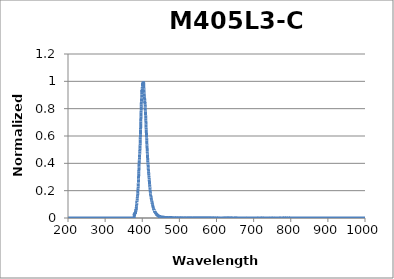
| Category | Normalized Intensity |
|---|---|
| 200.03757 | 0 |
| 200.24029 | 0 |
| 200.44301 | 0 |
| 200.64576 | 0 |
| 200.84852 | 0 |
| 201.0513 | 0 |
| 201.2541 | 0 |
| 201.45692 | 0 |
| 201.65975 | 0 |
| 201.8626 | 0 |
| 202.06546 | 0 |
| 202.26835 | 0 |
| 202.47125 | 0 |
| 202.67416 | 0 |
| 202.8771 | 0 |
| 203.08005 | 0 |
| 203.28302 | 0 |
| 203.486 | 0 |
| 203.68901 | 0 |
| 203.89203 | 0 |
| 204.09506 | 0 |
| 204.29812 | 0 |
| 204.50119 | 0 |
| 204.70428 | 0 |
| 204.90738 | 0 |
| 205.1105 | 0 |
| 205.31364 | 0 |
| 205.5168 | 0 |
| 205.71997 | 0 |
| 205.92316 | 0 |
| 206.12637 | 0 |
| 206.3296 | 0 |
| 206.53284 | 0 |
| 206.7361 | 0 |
| 206.93937 | 0 |
| 207.14266 | 0 |
| 207.34597 | 0 |
| 207.5493 | 0 |
| 207.75264 | 0 |
| 207.956 | 0 |
| 208.15938 | 0 |
| 208.36278 | 0 |
| 208.56619 | 0 |
| 208.76962 | 0 |
| 208.97306 | 0 |
| 209.17652 | 0 |
| 209.38 | 0 |
| 209.5835 | 0 |
| 209.78701 | 0 |
| 209.99054 | 0 |
| 210.19409 | 0 |
| 210.39766 | 0 |
| 210.60124 | 0 |
| 210.80484 | 0 |
| 211.00845 | 0 |
| 211.21208 | 0 |
| 211.41573 | 0 |
| 211.6194 | 0 |
| 211.82308 | 0 |
| 212.02678 | 0 |
| 212.2305 | 0 |
| 212.43423 | 0 |
| 212.63798 | 0 |
| 212.84175 | 0 |
| 213.04554 | 0 |
| 213.24934 | 0 |
| 213.45316 | 0 |
| 213.65699 | 0 |
| 213.86084 | 0 |
| 214.06471 | 0 |
| 214.2686 | 0 |
| 214.4725 | 0 |
| 214.67642 | 0 |
| 214.88036 | 0 |
| 215.08431 | 0 |
| 215.28828 | 0 |
| 215.49227 | 0 |
| 215.69628 | 0 |
| 215.9003 | 0 |
| 216.10434 | 0 |
| 216.30839 | 0 |
| 216.51246 | 0 |
| 216.71655 | 0 |
| 216.92066 | 0 |
| 217.12478 | 0 |
| 217.32892 | 0 |
| 217.53308 | 0 |
| 217.73725 | 0 |
| 217.94144 | 0 |
| 218.14565 | 0 |
| 218.34987 | 0 |
| 218.55411 | 0 |
| 218.75837 | 0 |
| 218.96264 | 0 |
| 219.16693 | 0 |
| 219.37124 | 0 |
| 219.57557 | 0 |
| 219.77991 | 0 |
| 219.98427 | 0 |
| 220.18864 | 0 |
| 220.39303 | 0 |
| 220.59744 | 0 |
| 220.80187 | 0 |
| 221.00631 | 0 |
| 221.21077 | 0 |
| 221.41525 | 0 |
| 221.61974 | 0 |
| 221.82425 | 0 |
| 222.02878 | 0 |
| 222.23332 | 0 |
| 222.43788 | 0 |
| 222.64246 | 0 |
| 222.84705 | 0 |
| 223.05166 | 0 |
| 223.25629 | 0 |
| 223.46093 | 0 |
| 223.66559 | 0 |
| 223.87027 | 0 |
| 224.07496 | 0 |
| 224.27968 | 0 |
| 224.4844 | 0 |
| 224.68915 | 0 |
| 224.89391 | 0 |
| 225.09869 | 0 |
| 225.30348 | 0 |
| 225.50829 | 0 |
| 225.71312 | 0 |
| 225.91797 | 0 |
| 226.12283 | 0 |
| 226.32771 | 0 |
| 226.5326 | 0 |
| 226.73751 | 0 |
| 226.94244 | 0 |
| 227.14739 | 0 |
| 227.35235 | 0 |
| 227.55733 | 0 |
| 227.76232 | 0 |
| 227.96734 | 0 |
| 228.17237 | 0 |
| 228.37741 | 0 |
| 228.58247 | 0 |
| 228.78755 | 0 |
| 228.99265 | 0 |
| 229.19776 | 0 |
| 229.40289 | 0 |
| 229.60803 | 0 |
| 229.8132 | 0 |
| 230.01838 | 0 |
| 230.22357 | 0 |
| 230.42878 | 0 |
| 230.63401 | 0 |
| 230.83926 | 0 |
| 231.04452 | 0 |
| 231.2498 | 0 |
| 231.4551 | 0 |
| 231.66041 | 0 |
| 231.86574 | 0 |
| 232.07108 | 0 |
| 232.27644 | 0 |
| 232.48182 | 0 |
| 232.68722 | 0 |
| 232.89263 | 0 |
| 233.09806 | 0 |
| 233.3035 | 0 |
| 233.50897 | 0 |
| 233.71444 | 0 |
| 233.91994 | 0 |
| 234.12545 | 0 |
| 234.33098 | 0 |
| 234.53653 | 0 |
| 234.74209 | 0 |
| 234.94766 | 0 |
| 235.15326 | 0 |
| 235.35887 | 0 |
| 235.5645 | 0 |
| 235.77014 | 0 |
| 235.9758 | 0 |
| 236.18148 | 0 |
| 236.38718 | 0 |
| 236.59289 | 0 |
| 236.79861 | 0 |
| 237.00436 | 0 |
| 237.21012 | 0 |
| 237.4159 | 0 |
| 237.62169 | 0 |
| 237.8275 | 0 |
| 238.03333 | 0 |
| 238.23917 | 0 |
| 238.44503 | 0 |
| 238.65091 | 0 |
| 238.8568 | 0 |
| 239.06271 | 0 |
| 239.26863 | 0 |
| 239.47458 | 0 |
| 239.68054 | 0 |
| 239.88651 | 0 |
| 240.0925 | 0 |
| 240.29851 | 0 |
| 240.50454 | 0 |
| 240.71058 | 0 |
| 240.91664 | 0 |
| 241.12271 | 0 |
| 241.3288 | 0 |
| 241.53491 | 0 |
| 241.74103 | 0 |
| 241.94717 | 0 |
| 242.15333 | 0 |
| 242.3595 | 0 |
| 242.56569 | 0 |
| 242.7719 | 0 |
| 242.97812 | 0 |
| 243.18436 | 0 |
| 243.39062 | 0 |
| 243.59689 | 0 |
| 243.80318 | 0 |
| 244.00949 | 0 |
| 244.21581 | 0 |
| 244.42215 | 0 |
| 244.6285 | 0 |
| 244.83487 | 0 |
| 245.04126 | 0 |
| 245.24766 | 0 |
| 245.45408 | 0 |
| 245.66052 | 0 |
| 245.86697 | 0 |
| 246.07344 | 0 |
| 246.27993 | 0 |
| 246.48643 | 0 |
| 246.69295 | 0 |
| 246.89949 | 0 |
| 247.10604 | 0 |
| 247.31261 | 0 |
| 247.51919 | 0 |
| 247.72579 | 0 |
| 247.93241 | 0 |
| 248.13904 | 0 |
| 248.34569 | 0 |
| 248.55236 | 0 |
| 248.75904 | 0 |
| 248.96574 | 0 |
| 249.17246 | 0 |
| 249.37919 | 0 |
| 249.58594 | 0 |
| 249.7927 | 0 |
| 249.99948 | 0 |
| 250.20628 | 0 |
| 250.4131 | 0 |
| 250.61993 | 0 |
| 250.82677 | 0 |
| 251.03364 | 0 |
| 251.24052 | 0 |
| 251.44741 | 0 |
| 251.65432 | 0 |
| 251.86125 | 0 |
| 252.0682 | 0 |
| 252.27516 | 0 |
| 252.48213 | 0 |
| 252.68913 | 0 |
| 252.89614 | 0 |
| 253.10316 | 0 |
| 253.31021 | 0 |
| 253.51727 | 0 |
| 253.72434 | 0 |
| 253.93143 | 0 |
| 254.13854 | 0 |
| 254.34567 | 0 |
| 254.55281 | 0 |
| 254.75996 | 0 |
| 254.96714 | 0 |
| 255.17433 | 0 |
| 255.38153 | 0 |
| 255.58875 | 0 |
| 255.79599 | 0 |
| 256.00325 | 0 |
| 256.21052 | 0 |
| 256.4178 | 0 |
| 256.62511 | 0 |
| 256.83243 | 0 |
| 257.03976 | 0 |
| 257.24711 | 0 |
| 257.45448 | 0 |
| 257.66187 | 0 |
| 257.86927 | 0 |
| 258.07669 | 0 |
| 258.28412 | 0 |
| 258.49157 | 0 |
| 258.69903 | 0 |
| 258.90652 | 0 |
| 259.11401 | 0 |
| 259.32153 | 0 |
| 259.52906 | 0 |
| 259.73661 | 0 |
| 259.94417 | 0 |
| 260.15175 | 0 |
| 260.35935 | 0 |
| 260.56696 | 0 |
| 260.77459 | 0 |
| 260.98223 | 0 |
| 261.18989 | 0 |
| 261.39757 | 0 |
| 261.60526 | 0 |
| 261.81297 | 0 |
| 262.02069 | 0 |
| 262.22844 | 0 |
| 262.43619 | 0 |
| 262.64397 | 0 |
| 262.85176 | 0 |
| 263.05956 | 0 |
| 263.26739 | 0 |
| 263.47522 | 0 |
| 263.68308 | 0 |
| 263.89095 | 0 |
| 264.09884 | 0 |
| 264.30674 | 0 |
| 264.51466 | 0 |
| 264.72259 | 0 |
| 264.93055 | 0 |
| 265.13851 | 0 |
| 265.3465 | 0 |
| 265.5545 | 0 |
| 265.76251 | 0 |
| 265.97054 | 0 |
| 266.17859 | 0 |
| 266.38666 | 0 |
| 266.59474 | 0 |
| 266.80283 | 0 |
| 267.01095 | 0 |
| 267.21908 | 0 |
| 267.42722 | 0 |
| 267.63538 | 0 |
| 267.84356 | 0 |
| 268.05175 | 0 |
| 268.25996 | 0 |
| 268.46819 | 0 |
| 268.67643 | 0 |
| 268.88469 | 0 |
| 269.09296 | 0 |
| 269.30125 | 0 |
| 269.50956 | 0 |
| 269.71788 | 0 |
| 269.92622 | 0 |
| 270.13457 | 0 |
| 270.34294 | 0 |
| 270.55133 | 0 |
| 270.75973 | 0 |
| 270.96815 | 0 |
| 271.17658 | 0 |
| 271.38503 | 0 |
| 271.5935 | 0 |
| 271.80198 | 0 |
| 272.01048 | 0 |
| 272.21899 | 0 |
| 272.42753 | 0 |
| 272.63607 | 0 |
| 272.84463 | 0 |
| 273.05321 | 0 |
| 273.26181 | 0 |
| 273.47042 | 0 |
| 273.67905 | 0 |
| 273.88769 | 0 |
| 274.09635 | 0 |
| 274.30502 | 0 |
| 274.51371 | 0 |
| 274.72242 | 0 |
| 274.93114 | 0 |
| 275.13988 | 0 |
| 275.34864 | 0 |
| 275.55741 | 0 |
| 275.76619 | 0 |
| 275.975 | 0 |
| 276.18381 | 0 |
| 276.39265 | 0 |
| 276.6015 | 0 |
| 276.81037 | 0 |
| 277.01925 | 0 |
| 277.22815 | 0 |
| 277.43706 | 0 |
| 277.64599 | 0 |
| 277.85494 | 0 |
| 278.0639 | 0 |
| 278.27288 | 0 |
| 278.48187 | 0 |
| 278.69088 | 0 |
| 278.89991 | 0 |
| 279.10895 | 0 |
| 279.31801 | 0 |
| 279.52708 | 0 |
| 279.73617 | 0 |
| 279.94528 | 0 |
| 280.1544 | 0 |
| 280.36354 | 0 |
| 280.57269 | 0 |
| 280.78186 | 0 |
| 280.99104 | 0 |
| 281.20025 | 0 |
| 281.40946 | 0 |
| 281.6187 | 0 |
| 281.82794 | 0 |
| 282.03721 | 0 |
| 282.24649 | 0 |
| 282.45579 | 0 |
| 282.6651 | 0 |
| 282.87443 | 0 |
| 283.08377 | 0 |
| 283.29313 | 0 |
| 283.50251 | 0 |
| 283.7119 | 0 |
| 283.92131 | 0 |
| 284.13073 | 0 |
| 284.34017 | 0 |
| 284.54962 | 0 |
| 284.75909 | 0 |
| 284.96858 | 0 |
| 285.17808 | 0 |
| 285.3876 | 0 |
| 285.59714 | 0 |
| 285.80669 | 0 |
| 286.01625 | 0 |
| 286.22583 | 0 |
| 286.43543 | 0 |
| 286.64505 | 0 |
| 286.85467 | 0 |
| 287.06432 | 0 |
| 287.27398 | 0 |
| 287.48366 | 0 |
| 287.69335 | 0 |
| 287.90306 | 0 |
| 288.11278 | 0 |
| 288.32252 | 0 |
| 288.53228 | 0 |
| 288.74205 | 0 |
| 288.95184 | 0 |
| 289.16164 | 0 |
| 289.37146 | 0 |
| 289.58129 | 0 |
| 289.79114 | 0 |
| 290.00101 | 0 |
| 290.21089 | 0 |
| 290.42079 | 0 |
| 290.6307 | 0 |
| 290.84063 | 0 |
| 291.05058 | 0 |
| 291.26054 | 0 |
| 291.47051 | 0 |
| 291.68051 | 0 |
| 291.89051 | 0 |
| 292.10054 | 0 |
| 292.31058 | 0 |
| 292.52063 | 0 |
| 292.7307 | 0 |
| 292.94079 | 0 |
| 293.15089 | 0 |
| 293.36101 | 0 |
| 293.57114 | 0 |
| 293.78129 | 0 |
| 293.99146 | 0 |
| 294.20164 | 0 |
| 294.41183 | 0 |
| 294.62205 | 0 |
| 294.83228 | 0 |
| 295.04252 | 0 |
| 295.25278 | 0 |
| 295.46305 | 0 |
| 295.67334 | 0 |
| 295.88365 | 0 |
| 296.09397 | 0 |
| 296.30431 | 0 |
| 296.51466 | 0 |
| 296.72503 | 0 |
| 296.93542 | 0 |
| 297.14582 | 0 |
| 297.35623 | 0 |
| 297.56667 | 0 |
| 297.77711 | 0 |
| 297.98758 | 0 |
| 298.19805 | 0 |
| 298.40855 | 0 |
| 298.61906 | 0 |
| 298.82958 | 0 |
| 299.04013 | 0 |
| 299.25068 | 0 |
| 299.46126 | 0 |
| 299.67184 | 0 |
| 299.88245 | 0 |
| 300.09307 | 0 |
| 300.3037 | 0 |
| 300.51435 | 0 |
| 300.72502 | 0 |
| 300.9357 | 0 |
| 301.1464 | 0 |
| 301.35711 | 0 |
| 301.56784 | 0 |
| 301.77858 | 0 |
| 301.98934 | 0 |
| 302.20012 | 0 |
| 302.41091 | 0 |
| 302.62172 | 0 |
| 302.83254 | 0 |
| 303.04338 | 0 |
| 303.25423 | 0 |
| 303.4651 | 0 |
| 303.67598 | 0 |
| 303.88688 | 0 |
| 304.0978 | 0 |
| 304.30873 | 0 |
| 304.51968 | 0 |
| 304.73064 | 0 |
| 304.94162 | 0 |
| 305.15261 | 0 |
| 305.36362 | 0 |
| 305.57464 | 0 |
| 305.78568 | 0 |
| 305.99674 | 0 |
| 306.20781 | 0 |
| 306.4189 | 0 |
| 306.63 | 0 |
| 306.84111 | 0 |
| 307.05225 | 0 |
| 307.2634 | 0 |
| 307.47456 | 0 |
| 307.68574 | 0 |
| 307.89694 | 0 |
| 308.10815 | 0 |
| 308.31937 | 0 |
| 308.53061 | 0 |
| 308.74187 | 0 |
| 308.95314 | 0 |
| 309.16443 | 0 |
| 309.37573 | 0 |
| 309.58705 | 0 |
| 309.79839 | 0 |
| 310.00974 | 0 |
| 310.2211 | 0 |
| 310.43248 | 0 |
| 310.64388 | 0 |
| 310.85529 | 0 |
| 311.06672 | 0 |
| 311.27816 | 0 |
| 311.48962 | 0 |
| 311.70109 | 0 |
| 311.91258 | 0 |
| 312.12409 | 0 |
| 312.33561 | 0 |
| 312.54714 | 0 |
| 312.75869 | 0 |
| 312.97026 | 0 |
| 313.18184 | 0 |
| 313.39344 | 0 |
| 313.60505 | 0 |
| 313.81668 | 0 |
| 314.02832 | 0 |
| 314.23998 | 0 |
| 314.45166 | 0 |
| 314.66335 | 0 |
| 314.87505 | 0 |
| 315.08677 | 0 |
| 315.29851 | 0 |
| 315.51026 | 0 |
| 315.72202 | 0 |
| 315.93381 | 0 |
| 316.1456 | 0 |
| 316.35742 | 0 |
| 316.56925 | 0 |
| 316.78109 | 0 |
| 316.99295 | 0 |
| 317.20482 | 0 |
| 317.41671 | 0 |
| 317.62862 | 0 |
| 317.84054 | 0 |
| 318.05247 | 0 |
| 318.26442 | 0 |
| 318.47639 | 0 |
| 318.68837 | 0 |
| 318.90037 | 0 |
| 319.11238 | 0 |
| 319.32441 | 0 |
| 319.53645 | 0 |
| 319.74851 | 0 |
| 319.96058 | 0 |
| 320.17267 | 0 |
| 320.38478 | 0 |
| 320.5969 | 0 |
| 320.80903 | 0 |
| 321.02118 | 0 |
| 321.23335 | 0 |
| 321.44553 | 0 |
| 321.65772 | 0 |
| 321.86994 | 0 |
| 322.08216 | 0 |
| 322.2944 | 0 |
| 322.50666 | 0 |
| 322.71893 | 0 |
| 322.93122 | 0 |
| 323.14353 | 0 |
| 323.35584 | 0 |
| 323.56818 | 0 |
| 323.78053 | 0 |
| 323.99289 | 0 |
| 324.20527 | 0 |
| 324.41767 | 0 |
| 324.63008 | 0 |
| 324.8425 | 0 |
| 325.05494 | 0 |
| 325.2674 | 0 |
| 325.47987 | 0 |
| 325.69235 | 0 |
| 325.90486 | 0 |
| 326.11737 | 0 |
| 326.32991 | 0 |
| 326.54245 | 0 |
| 326.75502 | 0 |
| 326.96759 | 0 |
| 327.18019 | 0 |
| 327.39279 | 0 |
| 327.60542 | 0 |
| 327.81806 | 0 |
| 328.03071 | 0 |
| 328.24338 | 0 |
| 328.45606 | 0 |
| 328.66876 | 0 |
| 328.88148 | 0 |
| 329.09421 | 0 |
| 329.30695 | 0 |
| 329.51971 | 0 |
| 329.73249 | 0 |
| 329.94528 | 0 |
| 330.15808 | 0 |
| 330.3709 | 0 |
| 330.58374 | 0 |
| 330.79659 | 0 |
| 331.00946 | 0 |
| 331.22234 | 0 |
| 331.43524 | 0 |
| 331.64815 | 0 |
| 331.86107 | 0 |
| 332.07402 | 0 |
| 332.28697 | 0 |
| 332.49995 | 0 |
| 332.71293 | 0 |
| 332.92594 | 0 |
| 333.13895 | 0 |
| 333.35199 | 0 |
| 333.56504 | 0 |
| 333.7781 | 0 |
| 333.99118 | 0 |
| 334.20427 | 0 |
| 334.41738 | 0 |
| 334.6305 | 0 |
| 334.84364 | 0 |
| 335.0568 | 0 |
| 335.26996 | 0 |
| 335.48315 | 0 |
| 335.69635 | 0 |
| 335.90956 | 0 |
| 336.12279 | 0 |
| 336.33604 | 0 |
| 336.5493 | 0 |
| 336.76257 | 0 |
| 336.97586 | 0 |
| 337.18917 | 0 |
| 337.40248 | 0 |
| 337.61582 | 0 |
| 337.82917 | 0 |
| 338.04253 | 0 |
| 338.25592 | 0 |
| 338.46931 | 0 |
| 338.68272 | 0 |
| 338.89615 | 0 |
| 339.10959 | 0 |
| 339.32304 | 0 |
| 339.53651 | 0 |
| 339.75 | 0 |
| 339.9635 | 0 |
| 340.17701 | 0 |
| 340.39054 | 0 |
| 340.60409 | 0 |
| 340.81765 | 0 |
| 341.03123 | 0 |
| 341.24482 | 0 |
| 341.45842 | 0 |
| 341.67204 | 0 |
| 341.88568 | 0 |
| 342.09933 | 0 |
| 342.31299 | 0 |
| 342.52667 | 0 |
| 342.74037 | 0 |
| 342.95408 | 0 |
| 343.16781 | 0 |
| 343.38155 | 0 |
| 343.5953 | 0 |
| 343.80907 | 0 |
| 344.02286 | 0 |
| 344.23666 | 0 |
| 344.45047 | 0 |
| 344.6643 | 0 |
| 344.87815 | 0 |
| 345.09201 | 0 |
| 345.30589 | 0 |
| 345.51978 | 0 |
| 345.73368 | 0 |
| 345.9476 | 0 |
| 346.16154 | 0 |
| 346.37549 | 0 |
| 346.58945 | 0 |
| 346.80343 | 0 |
| 347.01743 | 0 |
| 347.23144 | 0 |
| 347.44546 | 0 |
| 347.6595 | 0 |
| 347.87355 | 0 |
| 348.08762 | 0 |
| 348.30171 | 0 |
| 348.51581 | 0 |
| 348.72992 | 0 |
| 348.94405 | 0 |
| 349.15819 | 0 |
| 349.37235 | 0 |
| 349.58653 | 0 |
| 349.80072 | 0 |
| 350.01492 | 0 |
| 350.22914 | 0 |
| 350.44337 | 0 |
| 350.65762 | 0 |
| 350.87188 | 0 |
| 351.08616 | 0 |
| 351.30045 | 0 |
| 351.51476 | 0 |
| 351.72908 | 0 |
| 351.94342 | 0 |
| 352.15777 | 0 |
| 352.37214 | 0 |
| 352.58652 | 0 |
| 352.80092 | 0 |
| 353.01533 | 0 |
| 353.22976 | 0 |
| 353.4442 | 0 |
| 353.65865 | 0 |
| 353.87312 | 0 |
| 354.08761 | 0 |
| 354.30211 | 0 |
| 354.51663 | 0 |
| 354.73116 | 0 |
| 354.9457 | 0 |
| 355.16026 | 0 |
| 355.37484 | 0 |
| 355.58943 | 0 |
| 355.80403 | 0 |
| 356.01865 | 0 |
| 356.23328 | 0 |
| 356.44793 | 0 |
| 356.6626 | 0 |
| 356.87727 | 0 |
| 357.09197 | 0 |
| 357.30667 | 0 |
| 357.5214 | 0 |
| 357.73613 | 0 |
| 357.95089 | 0 |
| 358.16565 | 0 |
| 358.38043 | 0 |
| 358.59523 | 0 |
| 358.81004 | 0 |
| 359.02487 | 0 |
| 359.23971 | 0 |
| 359.45456 | 0 |
| 359.66943 | 0 |
| 359.88432 | 0 |
| 360.09922 | 0 |
| 360.31413 | 0 |
| 360.52906 | 0 |
| 360.74401 | 0 |
| 360.95897 | 0 |
| 361.17394 | 0 |
| 361.38893 | 0 |
| 361.60393 | 0 |
| 361.81895 | 0 |
| 362.03398 | 0 |
| 362.24903 | 0 |
| 362.46409 | 0 |
| 362.67916 | 0 |
| 362.89426 | 0 |
| 363.10936 | 0 |
| 363.32448 | 0 |
| 363.53962 | 0 |
| 363.75477 | 0 |
| 363.96993 | 0 |
| 364.18511 | 0 |
| 364.4003 | 0 |
| 364.61551 | 0 |
| 364.83074 | 0 |
| 365.04597 | 0 |
| 365.26123 | 0 |
| 365.47649 | 0 |
| 365.69177 | 0 |
| 365.90707 | 0 |
| 366.12238 | 0 |
| 366.33771 | 0 |
| 366.55305 | 0 |
| 366.7684 | 0 |
| 366.98377 | 0 |
| 367.19916 | 0 |
| 367.41456 | 0 |
| 367.62997 | 0 |
| 367.8454 | 0 |
| 368.06084 | 0 |
| 368.2763 | 0 |
| 368.49177 | 0 |
| 368.70726 | 0 |
| 368.92276 | 0 |
| 369.13827 | 0 |
| 369.35381 | 0 |
| 369.56935 | 0 |
| 369.78491 | 0 |
| 370.00048 | 0 |
| 370.21607 | 0 |
| 370.43168 | 0 |
| 370.6473 | 0 |
| 370.86293 | 0 |
| 371.07858 | 0 |
| 371.29424 | 0 |
| 371.50991 | 0 |
| 371.7256 | 0 |
| 371.94131 | 0 |
| 372.15703 | 0 |
| 372.37276 | 0 |
| 372.58851 | 0 |
| 372.80428 | 0 |
| 373.02006 | 0 |
| 373.23585 | 0 |
| 373.45166 | 0 |
| 373.66748 | 0 |
| 373.88332 | 0 |
| 374.09917 | 0 |
| 374.31503 | 0 |
| 374.53091 | 0 |
| 374.74681 | 0 |
| 374.96272 | 0 |
| 375.17864 | 0 |
| 375.39458 | 0 |
| 375.61053 | 0 |
| 375.8265 | 0 |
| 376.04248 | 0 |
| 376.25848 | 0 |
| 376.47449 | 0 |
| 376.69051 | 0 |
| 376.90655 | 0 |
| 377.12261 | 0 |
| 377.33868 | 0 |
| 377.55476 | 0 |
| 377.77086 | 0 |
| 377.98697 | 0 |
| 378.2031 | 0 |
| 378.41924 | 0.014 |
| 378.63539 | 0.031 |
| 378.85156 | 0.019 |
| 379.06775 | 0.03 |
| 379.28395 | 0.017 |
| 379.50016 | 0.031 |
| 379.71639 | 0.029 |
| 379.93263 | 0.034 |
| 380.14889 | 0.03 |
| 380.36516 | 0.037 |
| 380.58144 | 0.028 |
| 380.79774 | 0.039 |
| 381.01406 | 0.033 |
| 381.23039 | 0.043 |
| 381.44673 | 0.035 |
| 381.66309 | 0.047 |
| 381.87946 | 0.038 |
| 382.09585 | 0.049 |
| 382.31225 | 0.044 |
| 382.52867 | 0.056 |
| 382.7451 | 0.054 |
| 382.96154 | 0.064 |
| 383.178 | 0.058 |
| 383.39447 | 0.066 |
| 383.61096 | 0.067 |
| 383.82746 | 0.074 |
| 384.04398 | 0.072 |
| 384.26051 | 0.083 |
| 384.47705 | 0.082 |
| 384.69361 | 0.094 |
| 384.91019 | 0.094 |
| 385.12678 | 0.105 |
| 385.34338 | 0.109 |
| 385.56 | 0.116 |
| 385.77663 | 0.116 |
| 385.99327 | 0.127 |
| 386.20993 | 0.129 |
| 386.42661 | 0.14 |
| 386.6433 | 0.143 |
| 386.86 | 0.152 |
| 387.07672 | 0.155 |
| 387.29345 | 0.165 |
| 387.5102 | 0.163 |
| 387.72696 | 0.179 |
| 387.94373 | 0.184 |
| 388.16052 | 0.199 |
| 388.37733 | 0.199 |
| 388.59414 | 0.212 |
| 388.81098 | 0.213 |
| 389.02782 | 0.231 |
| 389.24468 | 0.235 |
| 389.46156 | 0.253 |
| 389.67845 | 0.259 |
| 389.89535 | 0.281 |
| 390.11227 | 0.289 |
| 390.3292 | 0.314 |
| 390.54615 | 0.324 |
| 390.76311 | 0.342 |
| 390.98009 | 0.354 |
| 391.19708 | 0.371 |
| 391.41408 | 0.378 |
| 391.6311 | 0.401 |
| 391.84813 | 0.402 |
| 392.06518 | 0.423 |
| 392.28224 | 0.427 |
| 392.49931 | 0.445 |
| 392.7164 | 0.447 |
| 392.93351 | 0.465 |
| 393.15063 | 0.471 |
| 393.36776 | 0.486 |
| 393.58491 | 0.495 |
| 393.80207 | 0.501 |
| 394.01924 | 0.511 |
| 394.23643 | 0.531 |
| 394.45363 | 0.547 |
| 394.67085 | 0.573 |
| 394.88808 | 0.587 |
| 395.10533 | 0.613 |
| 395.32259 | 0.622 |
| 395.53987 | 0.648 |
| 395.75716 | 0.672 |
| 395.97446 | 0.694 |
| 396.19178 | 0.706 |
| 396.40911 | 0.745 |
| 396.62645 | 0.754 |
| 396.84381 | 0.773 |
| 397.06119 | 0.786 |
| 397.27858 | 0.813 |
| 397.49598 | 0.832 |
| 397.7134 | 0.85 |
| 397.93083 | 0.855 |
| 398.14827 | 0.876 |
| 398.36573 | 0.881 |
| 398.58321 | 0.902 |
| 398.8007 | 0.905 |
| 399.0182 | 0.92 |
| 399.23571 | 0.927 |
| 399.45324 | 0.938 |
| 399.67079 | 0.919 |
| 399.88835 | 0.937 |
| 400.10592 | 0.946 |
| 400.32351 | 0.959 |
| 400.54111 | 0.962 |
| 400.75872 | 0.968 |
| 400.97635 | 0.981 |
| 401.194 | 0.991 |
| 401.41166 | 0.984 |
| 401.62933 | 0.986 |
| 401.84701 | 0.979 |
| 402.06471 | 0.978 |
| 402.28243 | 0.97 |
| 402.50016 | 0.99 |
| 402.7179 | 0.997 |
| 402.93566 | 1 |
| 403.15343 | 0.996 |
| 403.37121 | 0.988 |
| 403.58901 | 0.99 |
| 403.80682 | 0.992 |
| 404.02465 | 0.982 |
| 404.24249 | 0.965 |
| 404.46035 | 0.947 |
| 404.67822 | 0.94 |
| 404.8961 | 0.922 |
| 405.114 | 0.922 |
| 405.33191 | 0.92 |
| 405.54984 | 0.911 |
| 405.76778 | 0.89 |
| 405.98573 | 0.879 |
| 406.2037 | 0.87 |
| 406.42168 | 0.874 |
| 406.63968 | 0.861 |
| 406.85769 | 0.85 |
| 407.07571 | 0.842 |
| 407.29375 | 0.847 |
| 407.51181 | 0.832 |
| 407.72987 | 0.833 |
| 407.94795 | 0.815 |
| 408.16605 | 0.809 |
| 408.38416 | 0.789 |
| 408.60228 | 0.778 |
| 408.82042 | 0.767 |
| 409.03857 | 0.754 |
| 409.25673 | 0.752 |
| 409.47491 | 0.727 |
| 409.69311 | 0.712 |
| 409.91131 | 0.694 |
| 410.12953 | 0.686 |
| 410.34777 | 0.663 |
| 410.56602 | 0.648 |
| 410.78428 | 0.637 |
| 411.00256 | 0.629 |
| 411.22085 | 0.618 |
| 411.43915 | 0.604 |
| 411.65747 | 0.589 |
| 411.87581 | 0.583 |
| 412.09415 | 0.568 |
| 412.31251 | 0.556 |
| 412.53089 | 0.537 |
| 412.74928 | 0.532 |
| 412.96768 | 0.523 |
| 413.1861 | 0.507 |
| 413.40453 | 0.489 |
| 413.62298 | 0.486 |
| 413.84143 | 0.472 |
| 414.05991 | 0.465 |
| 414.27839 | 0.446 |
| 414.49689 | 0.439 |
| 414.71541 | 0.429 |
| 414.93394 | 0.422 |
| 415.15248 | 0.406 |
| 415.37104 | 0.403 |
| 415.58961 | 0.391 |
| 415.80819 | 0.388 |
| 416.02679 | 0.37 |
| 416.2454 | 0.364 |
| 416.46403 | 0.355 |
| 416.68267 | 0.351 |
| 416.90132 | 0.338 |
| 417.11999 | 0.336 |
| 417.33867 | 0.323 |
| 417.55737 | 0.324 |
| 417.77608 | 0.312 |
| 417.9948 | 0.309 |
| 418.21354 | 0.297 |
| 418.43229 | 0.297 |
| 418.65106 | 0.282 |
| 418.86984 | 0.278 |
| 419.08863 | 0.27 |
| 419.30744 | 0.265 |
| 419.52626 | 0.256 |
| 419.74509 | 0.251 |
| 419.96394 | 0.243 |
| 420.18281 | 0.241 |
| 420.40168 | 0.228 |
| 420.62057 | 0.224 |
| 420.83948 | 0.213 |
| 421.0584 | 0.21 |
| 421.27733 | 0.202 |
| 421.49627 | 0.196 |
| 421.71523 | 0.187 |
| 421.93421 | 0.188 |
| 422.15319 | 0.178 |
| 422.37219 | 0.178 |
| 422.59121 | 0.169 |
| 422.81024 | 0.168 |
| 423.02928 | 0.16 |
| 423.24834 | 0.16 |
| 423.46741 | 0.152 |
| 423.68649 | 0.15 |
| 423.90559 | 0.146 |
| 424.1247 | 0.146 |
| 424.34383 | 0.139 |
| 424.56297 | 0.14 |
| 424.78212 | 0.133 |
| 425.00129 | 0.135 |
| 425.22047 | 0.129 |
| 425.43966 | 0.13 |
| 425.65887 | 0.122 |
| 425.8781 | 0.123 |
| 426.09733 | 0.115 |
| 426.31658 | 0.114 |
| 426.53585 | 0.108 |
| 426.75512 | 0.111 |
| 426.97441 | 0.105 |
| 427.19372 | 0.108 |
| 427.41304 | 0.098 |
| 427.63237 | 0.1 |
| 427.85172 | 0.096 |
| 428.07108 | 0.094 |
| 428.29045 | 0.089 |
| 428.50984 | 0.088 |
| 428.72924 | 0.083 |
| 428.94865 | 0.084 |
| 429.16808 | 0.079 |
| 429.38753 | 0.078 |
| 429.60698 | 0.077 |
| 429.82645 | 0.076 |
| 430.04594 | 0.069 |
| 430.26543 | 0.071 |
| 430.48495 | 0.067 |
| 430.70447 | 0.067 |
| 430.92401 | 0.062 |
| 431.14356 | 0.065 |
| 431.36313 | 0.059 |
| 431.58271 | 0.062 |
| 431.8023 | 0.06 |
| 432.02191 | 0.06 |
| 432.24153 | 0.057 |
| 432.46116 | 0.056 |
| 432.68081 | 0.052 |
| 432.90048 | 0.052 |
| 433.12015 | 0.049 |
| 433.33984 | 0.051 |
| 433.55954 | 0.046 |
| 433.77926 | 0.048 |
| 433.99899 | 0.045 |
| 434.21874 | 0.046 |
| 434.43849 | 0.044 |
| 434.65827 | 0.045 |
| 434.87805 | 0.039 |
| 435.09785 | 0.041 |
| 435.31766 | 0.038 |
| 435.53749 | 0.039 |
| 435.75733 | 0.036 |
| 435.97718 | 0.038 |
| 436.19705 | 0.033 |
| 436.41693 | 0.036 |
| 436.63682 | 0.032 |
| 436.85673 | 0.036 |
| 437.07665 | 0.032 |
| 437.29659 | 0.031 |
| 437.51654 | 0.03 |
| 437.7365 | 0.031 |
| 437.95648 | 0.028 |
| 438.17647 | 0.029 |
| 438.39647 | 0.026 |
| 438.61649 | 0.029 |
| 438.83652 | 0.025 |
| 439.05656 | 0.028 |
| 439.27662 | 0.024 |
| 439.49669 | 0.027 |
| 439.71678 | 0.022 |
| 439.93688 | 0.025 |
| 440.15699 | 0.022 |
| 440.37712 | 0.022 |
| 440.59725 | 0.02 |
| 440.81741 | 0.022 |
| 441.03757 | 0.019 |
| 441.25775 | 0.02 |
| 441.47795 | 0.018 |
| 441.69816 | 0.02 |
| 441.91838 | 0.017 |
| 442.13861 | 0.019 |
| 442.35886 | 0.017 |
| 442.57912 | 0.018 |
| 442.7994 | 0.015 |
| 443.01969 | 0.017 |
| 443.23999 | 0.014 |
| 443.4603 | 0.016 |
| 443.68063 | 0.013 |
| 443.90098 | 0.015 |
| 444.12133 | 0.013 |
| 444.3417 | 0.014 |
| 444.56209 | 0.012 |
| 444.78248 | 0.014 |
| 445.00289 | 0.01 |
| 445.22332 | 0.014 |
| 445.44376 | 0.01 |
| 445.66421 | 0.014 |
| 445.88467 | 0.01 |
| 446.10515 | 0.013 |
| 446.32564 | 0.011 |
| 446.54615 | 0.012 |
| 446.76666 | 0.011 |
| 446.9872 | 0.012 |
| 447.20774 | 0.009 |
| 447.4283 | 0.011 |
| 447.64887 | 0.01 |
| 447.86946 | 0.011 |
| 448.09006 | 0.008 |
| 448.31067 | 0.01 |
| 448.5313 | 0.008 |
| 448.75194 | 0.009 |
| 448.97259 | 0.008 |
| 449.19326 | 0.01 |
| 449.41394 | 0.007 |
| 449.63463 | 0.009 |
| 449.85534 | 0.007 |
| 450.07606 | 0.008 |
| 450.2968 | 0.006 |
| 450.51754 | 0.008 |
| 450.73831 | 0.006 |
| 450.95908 | 0.008 |
| 451.17987 | 0.006 |
| 451.40067 | 0.008 |
| 451.62148 | 0.006 |
| 451.84231 | 0.007 |
| 452.06315 | 0.006 |
| 452.28401 | 0.008 |
| 452.50488 | 0.005 |
| 452.72576 | 0.008 |
| 452.94666 | 0.005 |
| 453.16756 | 0.007 |
| 453.38849 | 0.004 |
| 453.60942 | 0.007 |
| 453.83037 | 0.004 |
| 454.05133 | 0.006 |
| 454.27231 | 0.004 |
| 454.4933 | 0.007 |
| 454.7143 | 0.004 |
| 454.93532 | 0.006 |
| 455.15635 | 0.005 |
| 455.37739 | 0.006 |
| 455.59845 | 0.004 |
| 455.81951 | 0.006 |
| 456.0406 | 0.004 |
| 456.26169 | 0.005 |
| 456.4828 | 0.003 |
| 456.70393 | 0.006 |
| 456.92506 | 0.003 |
| 457.14621 | 0.005 |
| 457.36738 | 0.002 |
| 457.58855 | 0.006 |
| 457.80974 | 0.003 |
| 458.03094 | 0.005 |
| 458.25216 | 0.003 |
| 458.47339 | 0.004 |
| 458.69463 | 0.003 |
| 458.91589 | 0.004 |
| 459.13716 | 0.004 |
| 459.35844 | 0.004 |
| 459.57974 | 0.002 |
| 459.80105 | 0.005 |
| 460.02237 | 0.003 |
| 460.24371 | 0.004 |
| 460.46506 | 0.002 |
| 460.68642 | 0.004 |
| 460.9078 | 0.003 |
| 461.12919 | 0.004 |
| 461.35059 | 0.003 |
| 461.572 | 0.004 |
| 461.79343 | 0.002 |
| 462.01488 | 0.004 |
| 462.23633 | 0.002 |
| 462.4578 | 0.004 |
| 462.67928 | 0.002 |
| 462.90078 | 0.003 |
| 463.12229 | 0.002 |
| 463.34381 | 0.004 |
| 463.56535 | 0.002 |
| 463.78689 | 0.004 |
| 464.00846 | 0.002 |
| 464.23003 | 0.003 |
| 464.45162 | 0.002 |
| 464.67322 | 0.004 |
| 464.89484 | 0.002 |
| 465.11647 | 0.004 |
| 465.33811 | 0.003 |
| 465.55976 | 0.003 |
| 465.78143 | 0.004 |
| 466.00311 | 0.002 |
| 466.2248 | 0.003 |
| 466.44651 | 0.002 |
| 466.66823 | 0.004 |
| 466.88997 | 0.002 |
| 467.11171 | 0.003 |
| 467.33348 | 0.002 |
| 467.55525 | 0.003 |
| 467.77704 | 0.002 |
| 467.99884 | 0.004 |
| 468.22065 | 0.002 |
| 468.44248 | 0.003 |
| 468.66432 | 0.001 |
| 468.88617 | 0.003 |
| 469.10803 | 0.001 |
| 469.32991 | 0.003 |
| 469.55181 | 0.001 |
| 469.77371 | 0.003 |
| 469.99563 | 0.001 |
| 470.21756 | 0.004 |
| 470.43951 | 0.001 |
| 470.66146 | 0.003 |
| 470.88344 | 0.001 |
| 471.10542 | 0.003 |
| 471.32742 | 0.001 |
| 471.54943 | 0.003 |
| 471.77145 | 0.002 |
| 471.99349 | 0.003 |
| 472.21554 | 0.001 |
| 472.4376 | 0.003 |
| 472.65968 | 0.001 |
| 472.88177 | 0.003 |
| 473.10387 | 0.001 |
| 473.32599 | 0.003 |
| 473.54812 | 0.001 |
| 473.77026 | 0.003 |
| 473.99242 | 0.002 |
| 474.21458 | 0.003 |
| 474.43677 | 0.001 |
| 474.65896 | 0.003 |
| 474.88117 | 0.002 |
| 475.10339 | 0.003 |
| 475.32562 | 0.001 |
| 475.54787 | 0.003 |
| 475.77013 | 0.002 |
| 475.9924 | 0.003 |
| 476.21469 | 0.001 |
| 476.43699 | 0.002 |
| 476.6593 | 0.001 |
| 476.88163 | 0.003 |
| 477.10397 | 0.001 |
| 477.32632 | 0.003 |
| 477.54868 | 0.002 |
| 477.77106 | 0.002 |
| 477.99345 | 0.001 |
| 478.21585 | 0.003 |
| 478.43827 | 0.002 |
| 478.6607 | 0.004 |
| 478.88314 | 0.001 |
| 479.1056 | 0.003 |
| 479.32807 | 0.002 |
| 479.55055 | 0.002 |
| 479.77305 | 0.001 |
| 479.99555 | 0.002 |
| 480.21808 | 0.001 |
| 480.44061 | 0.003 |
| 480.66316 | 0.001 |
| 480.88572 | 0.002 |
| 481.10829 | 0.002 |
| 481.33088 | 0.003 |
| 481.55348 | 0.001 |
| 481.77609 | 0.003 |
| 481.99871 | 0.001 |
| 482.22135 | 0.002 |
| 482.444 | 0.001 |
| 482.66667 | 0.002 |
| 482.88935 | 0.001 |
| 483.11204 | 0.002 |
| 483.33474 | 0.001 |
| 483.55746 | 0.002 |
| 483.78019 | 0.001 |
| 484.00293 | 0.002 |
| 484.22568 | 0.002 |
| 484.44845 | 0.002 |
| 484.67123 | 0 |
| 484.89403 | 0.002 |
| 485.11683 | 0.001 |
| 485.33965 | 0.003 |
| 485.56249 | 0.001 |
| 485.78533 | 0.002 |
| 486.00819 | 0.001 |
| 486.23106 | 0.003 |
| 486.45395 | 0 |
| 486.67685 | 0.002 |
| 486.89976 | 0.001 |
| 487.12268 | 0.003 |
| 487.34562 | 0.001 |
| 487.56857 | 0.003 |
| 487.79153 | 0.001 |
| 488.0145 | 0.002 |
| 488.23749 | 0.001 |
| 488.46049 | 0.002 |
| 488.68351 | 0.001 |
| 488.90653 | 0.002 |
| 489.12957 | 0.001 |
| 489.35263 | 0.003 |
| 489.57569 | 0.001 |
| 489.79877 | 0.002 |
| 490.02186 | 0.001 |
| 490.24497 | 0.002 |
| 490.46808 | 0.001 |
| 490.69121 | 0.002 |
| 490.91436 | 0.001 |
| 491.13751 | 0.002 |
| 491.36068 | 0.001 |
| 491.58386 | 0.002 |
| 491.80706 | 0.001 |
| 492.03026 | 0.002 |
| 492.25348 | 0.001 |
| 492.47672 | 0.002 |
| 492.69996 | 0.001 |
| 492.92322 | 0.002 |
| 493.14649 | 0.001 |
| 493.36978 | 0.002 |
| 493.59308 | 0.001 |
| 493.81639 | 0.002 |
| 494.03971 | 0 |
| 494.26304 | 0.002 |
| 494.48639 | 0.001 |
| 494.70975 | 0.003 |
| 494.93313 | 0 |
| 495.15652 | 0.003 |
| 495.37991 | 0 |
| 495.60333 | 0.002 |
| 495.82675 | 0.001 |
| 496.05019 | 0.002 |
| 496.27364 | 0.001 |
| 496.49711 | 0.002 |
| 496.72058 | 0 |
| 496.94407 | 0.002 |
| 497.16757 | 0.001 |
| 497.39109 | 0.002 |
| 497.61462 | 0.001 |
| 497.83816 | 0.002 |
| 498.06171 | 0.001 |
| 498.28528 | 0.002 |
| 498.50886 | 0.001 |
| 498.73245 | 0.002 |
| 498.95605 | 0.001 |
| 499.17967 | 0.002 |
| 499.4033 | 0.001 |
| 499.62694 | 0.002 |
| 499.8506 | 0.002 |
| 500.07427 | 0.002 |
| 500.29795 | 0.001 |
| 500.52164 | 0.002 |
| 500.74535 | 0.001 |
| 500.96907 | 0.002 |
| 501.1928 | 0.001 |
| 501.41654 | 0.002 |
| 501.6403 | 0.001 |
| 501.86407 | 0.002 |
| 502.08785 | 0.001 |
| 502.31165 | 0.003 |
| 502.53546 | 0.001 |
| 502.75928 | 0.002 |
| 502.98311 | 0.001 |
| 503.20696 | 0.002 |
| 503.43082 | 0.001 |
| 503.65469 | 0.002 |
| 503.87858 | 0.001 |
| 504.10247 | 0.002 |
| 504.32638 | 0.001 |
| 504.55031 | 0.002 |
| 504.77424 | 0.001 |
| 504.99819 | 0.002 |
| 505.22215 | 0.001 |
| 505.44612 | 0.002 |
| 505.67011 | 0.001 |
| 505.89411 | 0.002 |
| 506.11812 | 0.001 |
| 506.34214 | 0.002 |
| 506.56618 | 0.001 |
| 506.79023 | 0.002 |
| 507.01429 | 0.001 |
| 507.23837 | 0.002 |
| 507.46245 | 0.001 |
| 507.68655 | 0.001 |
| 507.91067 | 0.001 |
| 508.13479 | 0.002 |
| 508.35893 | 0.001 |
| 508.58308 | 0.002 |
| 508.80724 | 0.001 |
| 509.03142 | 0.001 |
| 509.25561 | 0.001 |
| 509.47981 | 0.002 |
| 509.70402 | 0.001 |
| 509.92825 | 0.002 |
| 510.15249 | 0.001 |
| 510.37674 | 0.002 |
| 510.601 | 0.001 |
| 510.82528 | 0.002 |
| 511.04957 | 0.001 |
| 511.27387 | 0.001 |
| 511.49818 | 0.001 |
| 511.72251 | 0.002 |
| 511.94685 | 0 |
| 512.1712 | 0.002 |
| 512.39557 | 0.001 |
| 512.61994 | 0.002 |
| 512.84433 | 0.001 |
| 513.06874 | 0.002 |
| 513.29315 | 0.001 |
| 513.51758 | 0.002 |
| 513.74202 | 0 |
| 513.96647 | 0.002 |
| 514.19094 | 0.001 |
| 514.41542 | 0.001 |
| 514.63991 | 0.001 |
| 514.86441 | 0.002 |
| 515.08892 | 0 |
| 515.31345 | 0.002 |
| 515.53799 | 0.001 |
| 515.76255 | 0.002 |
| 515.98711 | 0.001 |
| 516.21169 | 0.002 |
| 516.43628 | 0.001 |
| 516.66088 | 0.002 |
| 516.8855 | 0.001 |
| 517.11013 | 0.002 |
| 517.33477 | 0.001 |
| 517.55942 | 0.002 |
| 517.78409 | 0.001 |
| 518.00877 | 0.002 |
| 518.23346 | 0.001 |
| 518.45816 | 0.002 |
| 518.68287 | 0 |
| 518.9076 | 0.002 |
| 519.13234 | 0.001 |
| 519.3571 | 0.002 |
| 519.58186 | 0 |
| 519.80664 | 0.001 |
| 520.03143 | 0.001 |
| 520.25623 | 0.002 |
| 520.48105 | 0 |
| 520.70588 | 0.002 |
| 520.93072 | 0.001 |
| 521.15557 | 0.002 |
| 521.38044 | 0 |
| 521.60531 | 0.001 |
| 521.8302 | 0.001 |
| 522.05511 | 0.002 |
| 522.28002 | 0.001 |
| 522.50495 | 0.001 |
| 522.72989 | 0.002 |
| 522.95484 | 0 |
| 523.17981 | 0.002 |
| 523.40478 | 0 |
| 523.62977 | 0.002 |
| 523.85478 | 0.001 |
| 524.07979 | 0.002 |
| 524.30482 | 0.001 |
| 524.52986 | 0.002 |
| 524.75491 | 0 |
| 524.97997 | 0.002 |
| 525.20505 | 0 |
| 525.43014 | 0.002 |
| 525.65524 | 0 |
| 525.88035 | 0.002 |
| 526.10548 | 0 |
| 526.33062 | 0.002 |
| 526.55577 | 0.001 |
| 526.78093 | 0.002 |
| 527.00611 | 0.001 |
| 527.2313 | 0.002 |
| 527.4565 | 0 |
| 527.68171 | 0.002 |
| 527.90694 | 0 |
| 528.13217 | 0.002 |
| 528.35742 | 0.001 |
| 528.58269 | 0.002 |
| 528.80796 | 0 |
| 529.03325 | 0.002 |
| 529.25855 | 0 |
| 529.48386 | 0.002 |
| 529.70918 | 0.001 |
| 529.93452 | 0.002 |
| 530.15987 | 0.001 |
| 530.38523 | 0.002 |
| 530.6106 | 0.001 |
| 530.83599 | 0.002 |
| 531.06139 | 0 |
| 531.2868 | 0.002 |
| 531.51222 | 0 |
| 531.73765 | 0.002 |
| 531.9631 | 0 |
| 532.18856 | 0.002 |
| 532.41403 | 0 |
| 532.63952 | 0.001 |
| 532.86501 | 0.001 |
| 533.09052 | 0.002 |
| 533.31604 | 0.001 |
| 533.54157 | 0.002 |
| 533.76712 | 0 |
| 533.99268 | 0.002 |
| 534.21825 | 0 |
| 534.44383 | 0.002 |
| 534.66943 | 0.001 |
| 534.89503 | 0.002 |
| 535.12065 | 0 |
| 535.34628 | 0.001 |
| 535.57193 | 0 |
| 535.79758 | 0.002 |
| 536.02325 | 0 |
| 536.24893 | 0.001 |
| 536.47462 | 0 |
| 536.70033 | 0.002 |
| 536.92605 | 0 |
| 537.15178 | 0.002 |
| 537.37752 | 0.001 |
| 537.60327 | 0.001 |
| 537.82904 | 0 |
| 538.05482 | 0.001 |
| 538.28061 | 0 |
| 538.50641 | 0.002 |
| 538.73222 | 0.001 |
| 538.95805 | 0.002 |
| 539.18389 | 0 |
| 539.40974 | 0.001 |
| 539.63561 | 0 |
| 539.86148 | 0.002 |
| 540.08737 | 0 |
| 540.31327 | 0.002 |
| 540.53918 | 0 |
| 540.76511 | 0.001 |
| 540.99105 | 0.001 |
| 541.21699 | 0.001 |
| 541.44296 | 0 |
| 541.66893 | 0.001 |
| 541.89491 | 0 |
| 542.12091 | 0.001 |
| 542.34692 | 0.001 |
| 542.57294 | 0.001 |
| 542.79898 | 0.001 |
| 543.02503 | 0.002 |
| 543.25108 | 0.001 |
| 543.47715 | 0.001 |
| 543.70324 | 0 |
| 543.92933 | 0.001 |
| 544.15544 | 0 |
| 544.38156 | 0.001 |
| 544.60769 | 0 |
| 544.83383 | 0.001 |
| 545.05999 | 0.001 |
| 545.28616 | 0.001 |
| 545.51234 | 0.001 |
| 545.73853 | 0.002 |
| 545.96473 | 0.001 |
| 546.19095 | 0.001 |
| 546.41718 | 0.001 |
| 546.64342 | 0.001 |
| 546.86967 | 0 |
| 547.09594 | 0.001 |
| 547.32221 | 0.001 |
| 547.5485 | 0.001 |
| 547.7748 | 0.001 |
| 548.00112 | 0.001 |
| 548.22744 | 0 |
| 548.45378 | 0.001 |
| 548.68013 | 0.001 |
| 548.90649 | 0.001 |
| 549.13286 | 0 |
| 549.35925 | 0.001 |
| 549.58565 | 0 |
| 549.81206 | 0.001 |
| 550.03848 | 0.001 |
| 550.26491 | 0.001 |
| 550.49136 | 0 |
| 550.71782 | 0.002 |
| 550.94429 | 0 |
| 551.17077 | 0.001 |
| 551.39726 | 0 |
| 551.62377 | 0.001 |
| 551.85029 | 0 |
| 552.07682 | 0.001 |
| 552.30336 | 0.001 |
| 552.52991 | 0.001 |
| 552.75648 | 0 |
| 552.98306 | 0.001 |
| 553.20965 | 0 |
| 553.43625 | 0.001 |
| 553.66286 | 0.001 |
| 553.88949 | 0.002 |
| 554.11613 | 0 |
| 554.34278 | 0.001 |
| 554.56944 | 0.001 |
| 554.79611 | 0.001 |
| 555.0228 | 0 |
| 555.2495 | 0.002 |
| 555.47621 | 0 |
| 555.70293 | 0.001 |
| 555.92967 | 0 |
| 556.15641 | 0.001 |
| 556.38317 | 0 |
| 556.60994 | 0.001 |
| 556.83672 | 0.001 |
| 557.06352 | 0.001 |
| 557.29032 | 0 |
| 557.51714 | 0.001 |
| 557.74397 | 0 |
| 557.97081 | 0.001 |
| 558.19767 | 0.001 |
| 558.42453 | 0.001 |
| 558.65141 | 0 |
| 558.8783 | 0.001 |
| 559.1052 | 0 |
| 559.33211 | 0.002 |
| 559.55904 | 0 |
| 559.78598 | 0.001 |
| 560.01292 | 0 |
| 560.23989 | 0.001 |
| 560.46686 | 0 |
| 560.69384 | 0.001 |
| 560.92084 | 0 |
| 561.14785 | 0.001 |
| 561.37487 | 0.001 |
| 561.6019 | 0.002 |
| 561.82895 | 0 |
| 562.056 | 0.002 |
| 562.28307 | 0 |
| 562.51015 | 0.001 |
| 562.73724 | 0 |
| 562.96435 | 0.001 |
| 563.19146 | 0 |
| 563.41859 | 0.001 |
| 563.64573 | 0 |
| 563.87288 | 0.001 |
| 564.10005 | 0 |
| 564.32722 | 0.001 |
| 564.55441 | 0 |
| 564.78161 | 0.001 |
| 565.00882 | 0 |
| 565.23604 | 0.001 |
| 565.46327 | 0.001 |
| 565.69052 | 0.001 |
| 565.91778 | 0 |
| 566.14505 | 0.001 |
| 566.37233 | 0 |
| 566.59962 | 0.002 |
| 566.82693 | 0 |
| 567.05425 | 0.001 |
| 567.28158 | 0 |
| 567.50892 | 0.002 |
| 567.73627 | 0 |
| 567.96363 | 0.001 |
| 568.19101 | 0 |
| 568.4184 | 0.001 |
| 568.6458 | 0.001 |
| 568.87321 | 0.002 |
| 569.10063 | 0 |
| 569.32807 | 0.001 |
| 569.55552 | 0.001 |
| 569.78297 | 0.001 |
| 570.01044 | 0 |
| 570.23793 | 0.001 |
| 570.46542 | 0 |
| 570.69293 | 0.001 |
| 570.92045 | 0 |
| 571.14797 | 0.001 |
| 571.37552 | 0 |
| 571.60307 | 0.001 |
| 571.83063 | 0 |
| 572.05821 | 0.001 |
| 572.2858 | 0.001 |
| 572.5134 | 0.001 |
| 572.74101 | 0 |
| 572.96863 | 0.001 |
| 573.19627 | 0.001 |
| 573.42392 | 0.001 |
| 573.65158 | 0 |
| 573.87925 | 0.001 |
| 574.10693 | 0 |
| 574.33462 | 0.001 |
| 574.56233 | 0 |
| 574.79005 | 0.001 |
| 575.01777 | 0 |
| 575.24552 | 0.001 |
| 575.47327 | 0 |
| 575.70103 | 0.001 |
| 575.92881 | 0 |
| 576.1566 | 0.001 |
| 576.38439 | 0 |
| 576.61221 | 0.001 |
| 576.84003 | 0 |
| 577.06786 | 0.001 |
| 577.29571 | 0 |
| 577.52357 | 0.001 |
| 577.75144 | 0 |
| 577.97932 | 0.001 |
| 578.20721 | 0 |
| 578.43511 | 0.001 |
| 578.66303 | 0 |
| 578.89096 | 0.001 |
| 579.1189 | 0.001 |
| 579.34685 | 0.001 |
| 579.57481 | 0 |
| 579.80279 | 0.001 |
| 580.03077 | 0 |
| 580.25877 | 0.001 |
| 580.48678 | 0.001 |
| 580.7148 | 0 |
| 580.94283 | 0.001 |
| 581.17088 | 0 |
| 581.39893 | 0.001 |
| 581.627 | 0 |
| 581.85508 | 0.001 |
| 582.08317 | 0 |
| 582.31127 | 0.001 |
| 582.53939 | 0 |
| 582.76751 | 0.001 |
| 582.99565 | 0 |
| 583.2238 | 0.001 |
| 583.45196 | 0 |
| 583.68013 | 0.001 |
| 583.90831 | 0 |
| 584.13651 | 0.001 |
| 584.36472 | 0 |
| 584.59293 | 0.001 |
| 584.82116 | 0 |
| 585.04941 | 0.001 |
| 585.27766 | 0 |
| 585.50592 | 0.001 |
| 585.7342 | 0 |
| 585.96249 | 0.001 |
| 586.19079 | 0 |
| 586.4191 | 0.001 |
| 586.64742 | 0 |
| 586.87575 | 0.001 |
| 587.1041 | 0 |
| 587.33246 | 0.001 |
| 587.56083 | 0 |
| 587.78921 | 0.001 |
| 588.0176 | 0 |
| 588.246 | 0.001 |
| 588.47442 | 0 |
| 588.70284 | 0.001 |
| 588.93128 | 0 |
| 589.15973 | 0.001 |
| 589.38819 | 0 |
| 589.61666 | 0.001 |
| 589.84515 | 0 |
| 590.07364 | 0.001 |
| 590.30215 | 0 |
| 590.53067 | 0.001 |
| 590.7592 | 0 |
| 590.98774 | 0.001 |
| 591.21629 | 0 |
| 591.44486 | 0.001 |
| 591.67343 | 0 |
| 591.90202 | 0.001 |
| 592.13062 | 0 |
| 592.35923 | 0.001 |
| 592.58785 | 0 |
| 592.81648 | 0.001 |
| 593.04513 | 0 |
| 593.27378 | 0.001 |
| 593.50245 | 0 |
| 593.73113 | 0.001 |
| 593.95982 | 0 |
| 594.18852 | 0.001 |
| 594.41724 | 0 |
| 594.64596 | 0.001 |
| 594.8747 | 0 |
| 595.10345 | 0.001 |
| 595.33221 | 0 |
| 595.56098 | 0.001 |
| 595.78976 | 0 |
| 596.01855 | 0.001 |
| 596.24736 | 0 |
| 596.47617 | 0.001 |
| 596.705 | 0 |
| 596.93384 | 0.001 |
| 597.16269 | 0 |
| 597.39155 | 0.001 |
| 597.62043 | 0 |
| 597.84931 | 0.001 |
| 598.07821 | 0 |
| 598.30712 | 0.001 |
| 598.53604 | 0 |
| 598.76497 | 0.001 |
| 598.99391 | 0 |
| 599.22286 | 0.001 |
| 599.45183 | 0 |
| 599.6808 | 0.001 |
| 599.90979 | 0 |
| 600.13879 | 0.001 |
| 600.3678 | 0 |
| 600.59682 | 0.001 |
| 600.82585 | 0 |
| 601.0549 | 0.001 |
| 601.28395 | 0 |
| 601.51302 | 0.001 |
| 601.7421 | 0 |
| 601.97119 | 0.001 |
| 602.20029 | 0 |
| 602.4294 | 0.001 |
| 602.65852 | 0 |
| 602.88766 | 0.001 |
| 603.11681 | 0 |
| 603.34596 | 0.001 |
| 603.57513 | 0 |
| 603.80431 | 0.001 |
| 604.0335 | 0 |
| 604.26271 | 0.001 |
| 604.49192 | 0 |
| 604.72115 | 0.001 |
| 604.95038 | 0 |
| 605.17963 | 0.001 |
| 605.40889 | 0 |
| 605.63816 | 0.001 |
| 605.86744 | 0 |
| 606.09674 | 0.001 |
| 606.32604 | 0 |
| 606.55536 | 0.001 |
| 606.78469 | 0 |
| 607.01402 | 0.001 |
| 607.24337 | 0 |
| 607.47273 | 0.001 |
| 607.70211 | 0 |
| 607.93149 | 0.001 |
| 608.16089 | 0 |
| 608.39029 | 0.001 |
| 608.61971 | 0 |
| 608.84914 | 0 |
| 609.07858 | 0 |
| 609.30803 | 0.001 |
| 609.53749 | 0 |
| 609.76696 | 0 |
| 609.99645 | 0 |
| 610.22595 | 0.001 |
| 610.45545 | 0 |
| 610.68497 | 0.001 |
| 610.9145 | 0 |
| 611.14404 | 0.001 |
| 611.37359 | 0 |
| 611.60316 | 0.001 |
| 611.83273 | 0 |
| 612.06232 | 0 |
| 612.29191 | 0 |
| 612.52152 | 0.001 |
| 612.75114 | 0 |
| 612.98077 | 0.001 |
| 613.21041 | 0 |
| 613.44007 | 0.001 |
| 613.66973 | 0 |
| 613.89941 | 0.001 |
| 614.12909 | 0 |
| 614.35879 | 0.001 |
| 614.5885 | 0 |
| 614.81822 | 0.001 |
| 615.04795 | 0 |
| 615.27769 | 0.001 |
| 615.50745 | 0 |
| 615.73721 | 0.001 |
| 615.96699 | 0 |
| 616.19678 | 0.001 |
| 616.42657 | 0 |
| 616.65638 | 0.001 |
| 616.8862 | 0 |
| 617.11604 | 0.001 |
| 617.34588 | 0 |
| 617.57573 | 0.001 |
| 617.8056 | 0 |
| 618.03547 | 0.001 |
| 618.26536 | 0 |
| 618.49526 | 0.001 |
| 618.72517 | 0 |
| 618.95509 | 0.001 |
| 619.18502 | 0 |
| 619.41496 | 0.001 |
| 619.64492 | 0 |
| 619.87488 | 0.001 |
| 620.10486 | 0 |
| 620.33485 | 0.001 |
| 620.56485 | 0 |
| 620.79485 | 0.001 |
| 621.02488 | 0 |
| 621.25491 | 0.001 |
| 621.48495 | 0 |
| 621.715 | 0.001 |
| 621.94507 | 0 |
| 622.17514 | 0.001 |
| 622.40523 | 0 |
| 622.63533 | 0.001 |
| 622.86544 | 0 |
| 623.09556 | 0.001 |
| 623.32569 | 0 |
| 623.55583 | 0.001 |
| 623.78599 | 0 |
| 624.01615 | 0 |
| 624.24633 | 0 |
| 624.47651 | 0.001 |
| 624.70671 | 0 |
| 624.93692 | 0.001 |
| 625.16714 | 0 |
| 625.39737 | 0.001 |
| 625.62761 | 0 |
| 625.85786 | 0.001 |
| 626.08813 | 0 |
| 626.3184 | 0.001 |
| 626.54869 | 0 |
| 626.77898 | 0.001 |
| 627.00929 | 0 |
| 627.23961 | 0.001 |
| 627.46994 | -0.001 |
| 627.70028 | 0.001 |
| 627.93063 | 0 |
| 628.161 | 0.001 |
| 628.39137 | 0 |
| 628.62176 | 0.001 |
| 628.85215 | 0 |
| 629.08256 | 0.001 |
| 629.31298 | 0 |
| 629.5434 | 0.001 |
| 629.77384 | 0 |
| 630.00429 | 0.001 |
| 630.23476 | 0 |
| 630.46523 | 0.001 |
| 630.69571 | 0 |
| 630.92621 | 0.001 |
| 631.15671 | 0 |
| 631.38723 | 0.001 |
| 631.61776 | 0 |
| 631.84829 | 0.001 |
| 632.07884 | 0 |
| 632.3094 | 0.001 |
| 632.53997 | 0 |
| 632.77056 | 0.001 |
| 633.00115 | 0 |
| 633.23175 | 0.001 |
| 633.46237 | 0 |
| 633.69299 | 0.001 |
| 633.92363 | 0 |
| 634.15428 | 0.001 |
| 634.38494 | 0 |
| 634.6156 | 0.001 |
| 634.84628 | 0 |
| 635.07698 | 0.001 |
| 635.30768 | 0 |
| 635.53839 | 0.001 |
| 635.76911 | -0.001 |
| 635.99985 | 0.001 |
| 636.23059 | 0 |
| 636.46135 | 0 |
| 636.69212 | 0 |
| 636.9229 | 0.001 |
| 637.15369 | 0 |
| 637.38449 | 0.001 |
| 637.6153 | 0 |
| 637.84612 | 0.001 |
| 638.07695 | 0 |
| 638.30779 | 0.001 |
| 638.53865 | 0 |
| 638.76951 | 0.001 |
| 639.00039 | 0 |
| 639.23128 | 0 |
| 639.46217 | 0.001 |
| 639.69308 | 0 |
| 639.924 | 0.001 |
| 640.15493 | 0 |
| 640.38587 | 0.001 |
| 640.61682 | 0 |
| 640.84779 | 0.001 |
| 641.07876 | 0 |
| 641.30974 | 0.001 |
| 641.54074 | 0 |
| 641.77174 | 0.001 |
| 642.00276 | 0 |
| 642.23379 | 0.001 |
| 642.46483 | 0 |
| 642.69588 | 0.001 |
| 642.92694 | 0 |
| 643.15801 | 0.001 |
| 643.38909 | 0 |
| 643.62018 | 0.001 |
| 643.85128 | 0 |
| 644.0824 | 0.001 |
| 644.31352 | 0 |
| 644.54466 | 0.001 |
| 644.7758 | 0 |
| 645.00696 | 0 |
| 645.23813 | -0.001 |
| 645.4693 | 0.001 |
| 645.70049 | 0 |
| 645.93169 | 0.001 |
| 646.1629 | -0.001 |
| 646.39412 | 0.001 |
| 646.62536 | 0 |
| 646.8566 | 0.001 |
| 647.08785 | 0 |
| 647.31912 | 0.001 |
| 647.55039 | 0 |
| 647.78168 | 0.001 |
| 648.01297 | 0 |
| 648.24428 | 0.001 |
| 648.4756 | -0.001 |
| 648.70693 | 0.001 |
| 648.93827 | 0 |
| 649.16962 | 0 |
| 649.40098 | 0 |
| 649.63235 | 0.001 |
| 649.86373 | 0 |
| 650.09512 | 0.001 |
| 650.32653 | 0 |
| 650.55794 | 0.001 |
| 650.78937 | 0 |
| 651.0208 | 0.001 |
| 651.25225 | 0 |
| 651.48371 | 0.001 |
| 651.71517 | 0 |
| 651.94665 | 0.001 |
| 652.17814 | 0 |
| 652.40964 | 0.001 |
| 652.64115 | 0 |
| 652.87267 | 0.001 |
| 653.1042 | 0 |
| 653.33574 | 0.001 |
| 653.5673 | 0 |
| 653.79886 | 0.001 |
| 654.03044 | 0 |
| 654.26202 | 0.001 |
| 654.49362 | 0 |
| 654.72522 | 0 |
| 654.95684 | 0 |
| 655.18847 | 0.001 |
| 655.4201 | 0 |
| 655.65175 | 0.001 |
| 655.88341 | 0 |
| 656.11508 | 0.001 |
| 656.34676 | -0.001 |
| 656.57845 | 0 |
| 656.81015 | 0 |
| 657.04187 | 0.001 |
| 657.27359 | 0 |
| 657.50532 | 0.001 |
| 657.73707 | 0 |
| 657.96882 | 0.001 |
| 658.20059 | 0 |
| 658.43236 | 0 |
| 658.66415 | 0 |
| 658.89595 | 0.001 |
| 659.12775 | 0 |
| 659.35957 | 0 |
| 659.5914 | -0.001 |
| 659.82324 | 0 |
| 660.05509 | 0 |
| 660.28695 | 0 |
| 660.51882 | 0 |
| 660.7507 | 0 |
| 660.98259 | 0 |
| 661.2145 | 0 |
| 661.44641 | 0 |
| 661.67833 | 0 |
| 661.91027 | 0 |
| 662.14221 | 0.001 |
| 662.37417 | 0 |
| 662.60613 | 0.001 |
| 662.83811 | 0 |
| 663.07009 | 0.001 |
| 663.30209 | -0.001 |
| 663.5341 | 0.001 |
| 663.76612 | -0.001 |
| 663.99815 | 0.001 |
| 664.23019 | 0 |
| 664.46224 | 0.001 |
| 664.6943 | 0 |
| 664.92637 | 0 |
| 665.15845 | -0.001 |
| 665.39054 | 0 |
| 665.62264 | -0.001 |
| 665.85476 | 0 |
| 666.08688 | 0 |
| 666.31901 | 0 |
| 666.55116 | 0 |
| 666.78331 | 0.001 |
| 667.01548 | -0.001 |
| 667.24765 | 0 |
| 667.47984 | -0.001 |
| 667.71203 | 0 |
| 667.94424 | 0 |
| 668.17646 | 0.001 |
| 668.40869 | -0.001 |
| 668.64093 | 0 |
| 668.87317 | 0 |
| 669.10543 | 0 |
| 669.3377 | 0 |
| 669.56998 | 0 |
| 669.80227 | 0 |
| 670.03457 | 0 |
| 670.26689 | -0.001 |
| 670.49921 | 0 |
| 670.73154 | 0 |
| 670.96388 | 0.001 |
| 671.19624 | 0 |
| 671.4286 | 0.001 |
| 671.66097 | 0 |
| 671.89336 | 0.001 |
| 672.12575 | -0.001 |
| 672.35816 | 0.001 |
| 672.59057 | 0 |
| 672.823 | 0.001 |
| 673.05543 | -0.001 |
| 673.28788 | 0 |
| 673.52034 | 0 |
| 673.75281 | 0 |
| 673.98528 | 0 |
| 674.21777 | 0 |
| 674.45027 | -0.001 |
| 674.68278 | 0 |
| 674.9153 | 0 |
| 675.14783 | 0.001 |
| 675.38037 | -0.001 |
| 675.61292 | 0 |
| 675.84548 | -0.001 |
| 676.07805 | 0 |
| 676.31063 | 0 |
| 676.54322 | 0.001 |
| 676.77582 | 0 |
| 677.00844 | 0 |
| 677.24106 | 0 |
| 677.47369 | 0 |
| 677.70634 | -0.001 |
| 677.93899 | 0 |
| 678.17165 | -0.001 |
| 678.40433 | 0.001 |
| 678.63701 | -0.001 |
| 678.86971 | 0 |
| 679.10241 | -0.001 |
| 679.33513 | 0 |
| 679.56785 | -0.001 |
| 679.80059 | 0.001 |
| 680.03334 | 0 |
| 680.26609 | 0 |
| 680.49886 | 0 |
| 680.73164 | 0 |
| 680.96442 | 0 |
| 681.19722 | 0.001 |
| 681.43003 | -0.001 |
| 681.66285 | 0 |
| 681.89568 | -0.001 |
| 682.12852 | 0 |
| 682.36136 | 0 |
| 682.59422 | 0.001 |
| 682.82709 | -0.001 |
| 683.05997 | 0.001 |
| 683.29286 | 0 |
| 683.52576 | 0.001 |
| 683.75867 | 0 |
| 683.9916 | 0.001 |
| 684.22453 | 0 |
| 684.45747 | 0 |
| 684.69042 | -0.001 |
| 684.92338 | 0 |
| 685.15635 | 0 |
| 685.38934 | 0 |
| 685.62233 | -0.001 |
| 685.85533 | 0 |
| 686.08834 | -0.001 |
| 686.32137 | 0 |
| 686.5544 | -0.001 |
| 686.78744 | 0 |
| 687.0205 | -0.001 |
| 687.25356 | 0 |
| 687.48664 | 0 |
| 687.71972 | 0.001 |
| 687.95281 | -0.001 |
| 688.18592 | 0.001 |
| 688.41903 | 0 |
| 688.65216 | 0.001 |
| 688.88529 | 0 |
| 689.11844 | 0 |
| 689.3516 | 0 |
| 689.58476 | 0 |
| 689.81794 | 0 |
| 690.05112 | 0 |
| 690.28432 | -0.001 |
| 690.51753 | 0.001 |
| 690.75074 | -0.001 |
| 690.98397 | 0.001 |
| 691.21721 | 0 |
| 691.45045 | 0 |
| 691.68371 | -0.001 |
| 691.91698 | 0.001 |
| 692.15025 | 0 |
| 692.38354 | 0.001 |
| 692.61684 | -0.001 |
| 692.85015 | 0 |
| 693.08346 | -0.001 |
| 693.31679 | 0.001 |
| 693.55013 | -0.001 |
| 693.78348 | 0 |
| 694.01684 | -0.001 |
| 694.25021 | 0 |
| 694.48358 | -0.001 |
| 694.71697 | 0 |
| 694.95037 | 0 |
| 695.18378 | 0 |
| 695.4172 | -0.001 |
| 695.65063 | 0 |
| 695.88407 | 0 |
| 696.11752 | 0 |
| 696.35097 | -0.001 |
| 696.58444 | 0.001 |
| 696.81792 | -0.001 |
| 697.05141 | 0.001 |
| 697.28491 | -0.001 |
| 697.51842 | 0 |
| 697.75194 | -0.001 |
| 697.98547 | 0.001 |
| 698.21901 | -0.001 |
| 698.45256 | 0 |
| 698.68612 | 0 |
| 698.91969 | -0.001 |
| 699.15327 | 0.001 |
| 699.38686 | -0.001 |
| 699.62046 | 0.001 |
| 699.85407 | -0.001 |
| 700.08769 | 0 |
| 700.32132 | -0.001 |
| 700.55496 | 0 |
| 700.78861 | -0.001 |
| 701.02227 | 0 |
| 701.25594 | -0.001 |
| 701.48962 | 0.001 |
| 701.72331 | -0.001 |
| 701.95701 | 0.001 |
| 702.19072 | -0.001 |
| 702.42444 | 0 |
| 702.65817 | -0.001 |
| 702.89191 | 0 |
| 703.12566 | -0.001 |
| 703.35942 | 0.001 |
| 703.59319 | -0.001 |
| 703.82697 | 0 |
| 704.06076 | -0.001 |
| 704.29456 | 0 |
| 704.52837 | 0 |
| 704.76219 | 0.001 |
| 704.99602 | -0.001 |
| 705.22986 | 0 |
| 705.46371 | 0 |
| 705.69757 | 0 |
| 705.93144 | -0.001 |
| 706.16532 | 0.001 |
| 706.39921 | -0.001 |
| 706.6331 | 0 |
| 706.86701 | 0 |
| 707.10093 | 0 |
| 707.33486 | 0 |
| 707.5688 | 0 |
| 707.80275 | -0.001 |
| 708.03671 | 0 |
| 708.27068 | 0 |
| 708.50466 | 0.001 |
| 708.73865 | 0 |
| 708.97264 | 0.001 |
| 709.20665 | 0 |
| 709.44067 | 0 |
| 709.6747 | 0 |
| 709.90874 | 0.001 |
| 710.14279 | -0.001 |
| 710.37684 | 0.001 |
| 710.61091 | -0.001 |
| 710.84499 | 0.001 |
| 711.07908 | -0.001 |
| 711.31317 | 0 |
| 711.54728 | 0 |
| 711.7814 | 0 |
| 712.01553 | 0 |
| 712.24966 | 0 |
| 712.48381 | -0.001 |
| 712.71797 | 0 |
| 712.95213 | -0.001 |
| 713.18631 | 0.001 |
| 713.4205 | -0.001 |
| 713.65469 | 0.001 |
| 713.8889 | -0.001 |
| 714.12311 | 0.001 |
| 714.35734 | -0.001 |
| 714.59157 | 0 |
| 714.82582 | -0.001 |
| 715.06007 | 0.001 |
| 715.29434 | -0.001 |
| 715.52861 | 0 |
| 715.7629 | -0.001 |
| 715.99719 | 0 |
| 716.2315 | 0 |
| 716.46581 | 0.001 |
| 716.70013 | -0.001 |
| 716.93447 | 0 |
| 717.16881 | -0.001 |
| 717.40316 | 0 |
| 717.63753 | -0.001 |
| 717.8719 | 0.001 |
| 718.10628 | -0.001 |
| 718.34068 | 0.001 |
| 718.57508 | 0 |
| 718.80949 | 0.001 |
| 719.04391 | -0.001 |
| 719.27834 | 0.001 |
| 719.51278 | 0 |
| 719.74723 | 0 |
| 719.98169 | -0.001 |
| 720.21617 | 0.001 |
| 720.45065 | 0 |
| 720.68514 | 0.001 |
| 720.91963 | -0.001 |
| 721.15414 | 0.001 |
| 721.38866 | -0.001 |
| 721.62319 | 0 |
| 721.85773 | 0 |
| 722.09228 | 0 |
| 722.32684 | 0 |
| 722.56141 | 0.001 |
| 722.79598 | -0.001 |
| 723.03057 | 0 |
| 723.26517 | -0.001 |
| 723.49977 | 0 |
| 723.73439 | -0.001 |
| 723.96902 | 0 |
| 724.20365 | 0 |
| 724.4383 | 0 |
| 724.67295 | -0.001 |
| 724.90762 | 0 |
| 725.14229 | 0 |
| 725.37698 | 0 |
| 725.61167 | -0.001 |
| 725.84637 | 0 |
| 726.08109 | 0 |
| 726.31581 | 0.001 |
| 726.55054 | -0.001 |
| 726.78529 | 0.001 |
| 727.02004 | -0.001 |
| 727.2548 | 0 |
| 727.48957 | 0 |
| 727.72435 | 0 |
| 727.95914 | -0.001 |
| 728.19394 | 0.001 |
| 728.42875 | -0.001 |
| 728.66357 | 0 |
| 728.8984 | 0 |
| 729.13324 | 0 |
| 729.36809 | 0 |
| 729.60295 | 0.001 |
| 729.83781 | -0.001 |
| 730.07269 | 0.001 |
| 730.30758 | -0.001 |
| 730.54248 | 0 |
| 730.77738 | -0.001 |
| 731.0123 | 0 |
| 731.24722 | 0 |
| 731.48216 | 0.001 |
| 731.7171 | -0.001 |
| 731.95206 | 0.001 |
| 732.18702 | -0.001 |
| 732.422 | 0 |
| 732.65698 | -0.001 |
| 732.89197 | 0 |
| 733.12697 | -0.001 |
| 733.36199 | 0 |
| 733.59701 | 0 |
| 733.83204 | 0.001 |
| 734.06708 | -0.001 |
| 734.30213 | 0 |
| 734.53719 | -0.001 |
| 734.77226 | 0 |
| 735.00734 | 0 |
| 735.24242 | 0 |
| 735.47752 | -0.001 |
| 735.71263 | 0.001 |
| 735.94775 | -0.001 |
| 736.18287 | 0.001 |
| 736.41801 | 0 |
| 736.65316 | 0 |
| 736.88831 | 0 |
| 737.12348 | 0 |
| 737.35865 | -0.001 |
| 737.59383 | 0.001 |
| 737.82903 | -0.001 |
| 738.06423 | 0 |
| 738.29944 | 0 |
| 738.53466 | 0.001 |
| 738.76989 | -0.001 |
| 739.00514 | 0.001 |
| 739.24039 | -0.001 |
| 739.47565 | 0 |
| 739.71092 | 0 |
| 739.94619 | 0.001 |
| 740.18148 | 0 |
| 740.41678 | 0 |
| 740.65209 | -0.001 |
| 740.8874 | 0 |
| 741.12273 | 0 |
| 741.35807 | 0 |
| 741.59341 | -0.001 |
| 741.82877 | 0.001 |
| 742.06413 | 0 |
| 742.2995 | 0 |
| 742.53489 | -0.001 |
| 742.77028 | 0 |
| 743.00568 | 0 |
| 743.24109 | 0 |
| 743.47651 | -0.001 |
| 743.71195 | 0.001 |
| 743.94739 | -0.001 |
| 744.18283 | 0 |
| 744.41829 | -0.001 |
| 744.65376 | 0 |
| 744.88924 | -0.001 |
| 745.12473 | 0 |
| 745.36022 | -0.001 |
| 745.59573 | 0.001 |
| 745.83124 | -0.001 |
| 746.06677 | 0 |
| 746.3023 | -0.001 |
| 746.53785 | 0 |
| 746.7734 | -0.001 |
| 747.00896 | 0 |
| 747.24453 | 0 |
| 747.48011 | 0 |
| 747.7157 | 0 |
| 747.9513 | 0.001 |
| 748.18691 | -0.001 |
| 748.42253 | 0.001 |
| 748.65816 | -0.001 |
| 748.8938 | 0 |
| 749.12944 | -0.001 |
| 749.3651 | 0.001 |
| 749.60077 | 0 |
| 749.83644 | 0.001 |
| 750.07212 | -0.001 |
| 750.30782 | 0.001 |
| 750.54352 | -0.001 |
| 750.77923 | 0 |
| 751.01495 | -0.001 |
| 751.25069 | 0.001 |
| 751.48643 | -0.001 |
| 751.72218 | 0.001 |
| 751.95793 | 0 |
| 752.1937 | 0.001 |
| 752.42948 | -0.001 |
| 752.66527 | 0.001 |
| 752.90106 | -0.001 |
| 753.13687 | 0 |
| 753.37268 | -0.001 |
| 753.60851 | 0.001 |
| 753.84434 | -0.001 |
| 754.08019 | 0.001 |
| 754.31604 | -0.001 |
| 754.5519 | 0.001 |
| 754.78777 | -0.001 |
| 755.02365 | 0.001 |
| 755.25954 | -0.001 |
| 755.49544 | 0.001 |
| 755.73135 | -0.001 |
| 755.96726 | 0 |
| 756.20319 | 0 |
| 756.43913 | 0 |
| 756.67507 | -0.001 |
| 756.91102 | 0 |
| 757.14699 | -0.001 |
| 757.38296 | 0.001 |
| 757.61894 | -0.001 |
| 757.85493 | 0 |
| 758.09093 | -0.001 |
| 758.32694 | 0 |
| 758.56296 | -0.001 |
| 758.79899 | -0.001 |
| 759.03503 | 0 |
| 759.27108 | -0.001 |
| 759.50713 | 0.001 |
| 759.7432 | 0 |
| 759.97927 | 0 |
| 760.21536 | 0 |
| 760.45145 | 0 |
| 760.68755 | -0.001 |
| 760.92366 | 0.001 |
| 761.15978 | -0.001 |
| 761.39591 | 0 |
| 761.63205 | -0.001 |
| 761.8682 | 0 |
| 762.10436 | 0 |
| 762.34053 | 0 |
| 762.5767 | -0.001 |
| 762.81289 | 0.001 |
| 763.04908 | -0.001 |
| 763.28528 | 0.001 |
| 763.5215 | -0.001 |
| 763.75772 | 0 |
| 763.99395 | -0.001 |
| 764.23019 | 0.001 |
| 764.46644 | -0.001 |
| 764.7027 | 0 |
| 764.93897 | -0.001 |
| 765.17524 | 0 |
| 765.41153 | -0.001 |
| 765.64782 | 0 |
| 765.88413 | 0 |
| 766.12044 | 0 |
| 766.35676 | 0 |
| 766.5931 | 0.001 |
| 766.82944 | -0.001 |
| 767.06579 | 0 |
| 767.30215 | 0 |
| 767.53851 | 0 |
| 767.77489 | -0.001 |
| 768.01128 | 0.001 |
| 768.24767 | -0.001 |
| 768.48408 | 0.001 |
| 768.72049 | -0.001 |
| 768.95691 | 0 |
| 769.19335 | -0.001 |
| 769.42979 | 0.001 |
| 769.66624 | -0.001 |
| 769.9027 | 0 |
| 770.13917 | -0.001 |
| 770.37564 | 0.001 |
| 770.61213 | -0.001 |
| 770.84863 | 0.001 |
| 771.08513 | -0.001 |
| 771.32164 | 0 |
| 771.55817 | -0.001 |
| 771.7947 | 0 |
| 772.03124 | -0.001 |
| 772.26779 | 0 |
| 772.50435 | -0.001 |
| 772.74092 | 0.001 |
| 772.9775 | -0.001 |
| 773.21408 | 0.001 |
| 773.45068 | 0 |
| 773.68728 | 0 |
| 773.9239 | -0.001 |
| 774.16052 | 0 |
| 774.39715 | -0.001 |
| 774.63379 | 0.001 |
| 774.87044 | -0.001 |
| 775.1071 | 0 |
| 775.34377 | -0.001 |
| 775.58044 | 0.001 |
| 775.81713 | -0.001 |
| 776.05383 | 0 |
| 776.29053 | -0.001 |
| 776.52724 | 0.001 |
| 776.76396 | -0.001 |
| 777.00069 | 0 |
| 777.23743 | -0.001 |
| 777.47418 | 0 |
| 777.71094 | -0.001 |
| 777.94771 | 0.001 |
| 778.18448 | -0.001 |
| 778.42127 | 0.001 |
| 778.65806 | -0.001 |
| 778.89487 | 0 |
| 779.13168 | -0.001 |
| 779.3685 | 0.001 |
| 779.60533 | -0.001 |
| 779.84217 | 0.001 |
| 780.07901 | -0.001 |
| 780.31587 | 0.001 |
| 780.55274 | 0 |
| 780.78961 | 0 |
| 781.0265 | -0.001 |
| 781.26339 | 0 |
| 781.50029 | -0.001 |
| 781.7372 | 0.001 |
| 781.97412 | -0.002 |
| 782.21105 | 0 |
| 782.44798 | -0.001 |
| 782.68493 | 0 |
| 782.92189 | -0.001 |
| 783.15885 | 0 |
| 783.39582 | -0.001 |
| 783.6328 | 0.001 |
| 783.86979 | -0.001 |
| 784.10679 | 0 |
| 784.3438 | -0.001 |
| 784.58082 | 0.001 |
| 784.81785 | -0.001 |
| 785.05488 | 0.001 |
| 785.29193 | -0.002 |
| 785.52898 | 0.001 |
| 785.76604 | -0.001 |
| 786.00311 | 0.001 |
| 786.24019 | -0.001 |
| 786.47728 | 0.001 |
| 786.71438 | -0.001 |
| 786.95148 | 0.001 |
| 787.1886 | -0.001 |
| 787.42572 | 0 |
| 787.66286 | -0.001 |
| 787.9 | 0.001 |
| 788.13715 | -0.001 |
| 788.37431 | 0 |
| 788.61148 | -0.001 |
| 788.84865 | 0 |
| 789.08584 | -0.001 |
| 789.32303 | 0.001 |
| 789.56024 | -0.001 |
| 789.79745 | 0.001 |
| 790.03467 | -0.001 |
| 790.2719 | 0.001 |
| 790.50914 | -0.001 |
| 790.74639 | 0.001 |
| 790.98365 | -0.002 |
| 791.22091 | 0.001 |
| 791.45819 | -0.001 |
| 791.69547 | 0 |
| 791.93276 | -0.001 |
| 792.17006 | 0.001 |
| 792.40737 | -0.001 |
| 792.64469 | 0 |
| 792.88202 | -0.001 |
| 793.11935 | 0.001 |
| 793.3567 | 0 |
| 793.59405 | 0 |
| 793.83141 | 0 |
| 794.06878 | 0.001 |
| 794.30616 | -0.001 |
| 794.54355 | 0.001 |
| 794.78095 | -0.002 |
| 795.01836 | 0 |
| 795.25577 | -0.001 |
| 795.4932 | 0.001 |
| 795.73063 | 0 |
| 795.96807 | 0 |
| 796.20552 | -0.001 |
| 796.44298 | 0.001 |
| 796.68045 | -0.001 |
| 796.91792 | 0.001 |
| 797.15541 | -0.001 |
| 797.3929 | 0.001 |
| 797.6304 | -0.001 |
| 797.86791 | 0 |
| 798.10543 | -0.001 |
| 798.34296 | 0 |
| 798.5805 | -0.001 |
| 798.81805 | 0.001 |
| 799.0556 | -0.002 |
| 799.29316 | 0 |
| 799.53074 | -0.001 |
| 799.76832 | 0.001 |
| 800.00591 | -0.002 |
| 800.24351 | 0 |
| 800.48111 | 0 |
| 800.71873 | 0 |
| 800.95635 | 0 |
| 801.19399 | 0 |
| 801.43163 | 0 |
| 801.66928 | 0 |
| 801.90694 | 0 |
| 802.1446 | 0 |
| 802.38228 | 0 |
| 802.61997 | 0 |
| 802.85766 | 0 |
| 803.09536 | 0 |
| 803.33307 | 0 |
| 803.57079 | 0 |
| 803.80852 | 0 |
| 804.04626 | 0 |
| 804.28401 | 0 |
| 804.52176 | 0 |
| 804.75952 | 0 |
| 804.99729 | 0 |
| 805.23507 | 0 |
| 805.47286 | 0 |
| 805.71066 | 0 |
| 805.94847 | 0 |
| 806.18628 | 0 |
| 806.42411 | 0 |
| 806.66194 | 0 |
| 806.89978 | 0 |
| 807.13763 | 0 |
| 807.37549 | 0 |
| 807.61335 | 0 |
| 807.85123 | 0 |
| 808.08911 | 0 |
| 808.327 | 0 |
| 808.5649 | 0 |
| 808.80281 | 0 |
| 809.04073 | 0 |
| 809.27866 | 0 |
| 809.51659 | 0 |
| 809.75454 | 0 |
| 809.99249 | 0 |
| 810.23045 | 0 |
| 810.46842 | 0 |
| 810.7064 | 0 |
| 810.94438 | 0 |
| 811.18238 | 0 |
| 811.42038 | 0 |
| 811.65839 | 0 |
| 811.89642 | 0 |
| 812.13444 | 0 |
| 812.37248 | 0 |
| 812.61053 | 0 |
| 812.84858 | 0 |
| 813.08665 | 0 |
| 813.32472 | 0 |
| 813.5628 | 0 |
| 813.80089 | 0 |
| 814.03899 | 0 |
| 814.27709 | 0 |
| 814.51521 | 0 |
| 814.75333 | 0 |
| 814.99146 | 0 |
| 815.2296 | 0 |
| 815.46775 | 0 |
| 815.70591 | 0 |
| 815.94407 | 0 |
| 816.18225 | 0 |
| 816.42043 | 0 |
| 816.65862 | 0 |
| 816.89682 | 0 |
| 817.13503 | 0 |
| 817.37325 | 0 |
| 817.61147 | 0 |
| 817.8497 | 0 |
| 818.08795 | 0 |
| 818.3262 | 0 |
| 818.56445 | 0 |
| 818.80272 | 0 |
| 819.041 | 0 |
| 819.27928 | 0 |
| 819.51757 | 0 |
| 819.75588 | 0 |
| 819.99419 | 0 |
| 820.2325 | 0 |
| 820.47083 | 0 |
| 820.70916 | 0 |
| 820.94751 | 0 |
| 821.18586 | 0 |
| 821.42422 | 0 |
| 821.66259 | 0 |
| 821.90096 | 0 |
| 822.13935 | 0 |
| 822.37774 | 0 |
| 822.61615 | 0 |
| 822.85456 | 0 |
| 823.09298 | 0 |
| 823.3314 | 0 |
| 823.56984 | 0 |
| 823.80828 | 0 |
| 824.04674 | 0 |
| 824.2852 | 0 |
| 824.52367 | 0 |
| 824.76214 | 0 |
| 825.00063 | 0 |
| 825.23912 | 0 |
| 825.47763 | 0 |
| 825.71614 | 0 |
| 825.95466 | 0 |
| 826.19319 | 0 |
| 826.43172 | 0 |
| 826.67027 | 0 |
| 826.90882 | 0 |
| 827.14738 | 0 |
| 827.38595 | 0 |
| 827.62453 | 0 |
| 827.86311 | 0 |
| 828.10171 | 0 |
| 828.34031 | 0 |
| 828.57892 | 0 |
| 828.81754 | 0 |
| 829.05617 | 0 |
| 829.29481 | 0 |
| 829.53345 | 0 |
| 829.77211 | 0 |
| 830.01077 | 0 |
| 830.24944 | 0 |
| 830.48811 | 0 |
| 830.7268 | 0 |
| 830.96549 | 0 |
| 831.2042 | 0 |
| 831.44291 | 0 |
| 831.68163 | 0 |
| 831.92035 | 0 |
| 832.15909 | 0 |
| 832.39783 | 0 |
| 832.63659 | 0 |
| 832.87535 | 0 |
| 833.11412 | 0 |
| 833.35289 | 0 |
| 833.59168 | 0 |
| 833.83047 | 0 |
| 834.06928 | 0 |
| 834.30809 | 0 |
| 834.5469 | 0 |
| 834.78573 | 0 |
| 835.02457 | 0 |
| 835.26341 | 0 |
| 835.50226 | 0 |
| 835.74112 | 0 |
| 835.97999 | 0 |
| 836.21886 | 0 |
| 836.45775 | 0 |
| 836.69664 | 0 |
| 836.93554 | 0 |
| 837.17445 | 0 |
| 837.41337 | 0 |
| 837.65229 | 0 |
| 837.89123 | 0 |
| 838.13017 | 0 |
| 838.36912 | 0 |
| 838.60808 | 0 |
| 838.84705 | 0 |
| 839.08602 | 0 |
| 839.325 | 0 |
| 839.56399 | 0 |
| 839.80299 | 0 |
| 840.042 | 0 |
| 840.28102 | 0 |
| 840.52004 | 0 |
| 840.75907 | 0 |
| 840.99811 | 0 |
| 841.23716 | 0 |
| 841.47622 | 0 |
| 841.71528 | 0 |
| 841.95435 | 0 |
| 842.19344 | 0 |
| 842.43252 | 0 |
| 842.67162 | 0 |
| 842.91073 | 0 |
| 843.14984 | 0 |
| 843.38896 | 0 |
| 843.62809 | 0 |
| 843.86723 | 0 |
| 844.10638 | 0 |
| 844.34553 | 0 |
| 844.58469 | 0 |
| 844.82386 | 0 |
| 845.06304 | 0 |
| 845.30223 | 0 |
| 845.54142 | 0 |
| 845.78062 | 0 |
| 846.01984 | 0 |
| 846.25905 | 0 |
| 846.49828 | 0 |
| 846.73752 | 0 |
| 846.97676 | 0 |
| 847.21601 | 0 |
| 847.45527 | 0 |
| 847.69454 | 0 |
| 847.93381 | 0 |
| 848.1731 | 0 |
| 848.41239 | 0 |
| 848.65169 | 0 |
| 848.891 | 0 |
| 849.13031 | 0 |
| 849.36964 | 0 |
| 849.60897 | 0 |
| 849.84831 | 0 |
| 850.08766 | 0 |
| 850.32701 | 0 |
| 850.56638 | 0 |
| 850.80575 | 0 |
| 851.04513 | 0 |
| 851.28452 | 0 |
| 851.52391 | 0 |
| 851.76332 | 0 |
| 852.00273 | 0 |
| 852.24215 | 0 |
| 852.48158 | 0 |
| 852.72102 | 0 |
| 852.96046 | 0 |
| 853.19991 | 0 |
| 853.43937 | 0 |
| 853.67884 | 0 |
| 853.91832 | 0 |
| 854.1578 | 0 |
| 854.3973 | 0 |
| 854.6368 | 0 |
| 854.87631 | 0 |
| 855.11582 | 0 |
| 855.35535 | 0 |
| 855.59488 | 0 |
| 855.83442 | 0 |
| 856.07397 | 0 |
| 856.31352 | 0 |
| 856.55309 | 0 |
| 856.79266 | 0 |
| 857.03224 | 0 |
| 857.27183 | 0 |
| 857.51142 | 0 |
| 857.75103 | 0 |
| 857.99064 | 0 |
| 858.23026 | 0 |
| 858.46989 | 0 |
| 858.70952 | 0 |
| 858.94917 | 0 |
| 859.18882 | 0 |
| 859.42848 | 0 |
| 859.66815 | 0 |
| 859.90782 | 0 |
| 860.1475 | 0 |
| 860.3872 | 0 |
| 860.6269 | 0 |
| 860.8666 | 0 |
| 861.10632 | 0 |
| 861.34604 | 0 |
| 861.58577 | 0 |
| 861.82551 | 0 |
| 862.06526 | 0 |
| 862.30501 | 0 |
| 862.54477 | 0 |
| 862.78454 | 0 |
| 863.02432 | 0 |
| 863.26411 | 0 |
| 863.5039 | 0 |
| 863.7437 | 0 |
| 863.98351 | 0 |
| 864.22333 | 0 |
| 864.46316 | 0 |
| 864.70299 | 0 |
| 864.94283 | 0 |
| 865.18268 | 0 |
| 865.42254 | 0 |
| 865.6624 | 0 |
| 865.90227 | 0 |
| 866.14215 | 0 |
| 866.38204 | 0 |
| 866.62194 | 0 |
| 866.86184 | 0 |
| 867.10175 | 0 |
| 867.34167 | 0 |
| 867.5816 | 0 |
| 867.82153 | 0 |
| 868.06148 | 0 |
| 868.30143 | 0 |
| 868.54139 | 0 |
| 868.78135 | 0 |
| 869.02133 | 0 |
| 869.26131 | 0 |
| 869.5013 | 0 |
| 869.74129 | 0 |
| 869.9813 | 0 |
| 870.22131 | 0 |
| 870.46133 | 0 |
| 870.70136 | 0 |
| 870.9414 | 0 |
| 871.18144 | 0 |
| 871.42149 | 0 |
| 871.66155 | 0 |
| 871.90162 | 0 |
| 872.1417 | 0 |
| 872.38178 | 0 |
| 872.62187 | 0 |
| 872.86197 | 0 |
| 873.10208 | 0 |
| 873.34219 | 0 |
| 873.58231 | 0 |
| 873.82244 | 0 |
| 874.06258 | 0 |
| 874.30272 | 0 |
| 874.54288 | 0 |
| 874.78304 | 0 |
| 875.0232 | 0 |
| 875.26338 | 0 |
| 875.50356 | 0 |
| 875.74375 | 0 |
| 875.98395 | 0 |
| 876.22416 | 0 |
| 876.46437 | 0 |
| 876.7046 | 0 |
| 876.94483 | 0 |
| 877.18506 | 0 |
| 877.42531 | 0 |
| 877.66556 | 0 |
| 877.90582 | 0 |
| 878.14609 | 0 |
| 878.38637 | 0 |
| 878.62665 | 0 |
| 878.86694 | 0 |
| 879.10724 | 0 |
| 879.34755 | 0 |
| 879.58786 | 0 |
| 879.82818 | 0 |
| 880.06851 | 0 |
| 880.30885 | 0 |
| 880.54919 | 0 |
| 880.78955 | 0 |
| 881.02991 | 0 |
| 881.27028 | 0 |
| 881.51065 | 0 |
| 881.75103 | 0 |
| 881.99142 | 0 |
| 882.23182 | 0 |
| 882.47223 | 0 |
| 882.71264 | 0 |
| 882.95306 | 0 |
| 883.19349 | 0 |
| 883.43393 | 0 |
| 883.67437 | 0 |
| 883.91483 | 0 |
| 884.15528 | 0 |
| 884.39575 | 0 |
| 884.63623 | 0 |
| 884.87671 | 0 |
| 885.1172 | 0 |
| 885.35769 | 0 |
| 885.5982 | 0 |
| 885.83871 | 0 |
| 886.07923 | 0 |
| 886.31976 | 0 |
| 886.56029 | 0 |
| 886.80084 | 0 |
| 887.04139 | 0 |
| 887.28195 | 0 |
| 887.52251 | 0 |
| 887.76308 | 0 |
| 888.00366 | 0 |
| 888.24425 | 0 |
| 888.48485 | 0 |
| 888.72545 | 0 |
| 888.96606 | 0 |
| 889.20668 | 0 |
| 889.44731 | 0 |
| 889.68794 | 0 |
| 889.92858 | 0 |
| 890.16923 | 0 |
| 890.40989 | 0 |
| 890.65055 | 0 |
| 890.89122 | 0 |
| 891.1319 | 0 |
| 891.37258 | 0 |
| 891.61328 | 0 |
| 891.85398 | 0 |
| 892.09469 | 0 |
| 892.3354 | 0 |
| 892.57613 | 0 |
| 892.81686 | 0 |
| 893.0576 | 0 |
| 893.29834 | 0 |
| 893.5391 | 0 |
| 893.77986 | 0 |
| 894.02063 | 0 |
| 894.2614 | 0 |
| 894.50218 | 0 |
| 894.74298 | 0 |
| 894.98377 | 0 |
| 895.22458 | 0 |
| 895.46539 | 0 |
| 895.70621 | 0 |
| 895.94704 | 0 |
| 896.18788 | 0 |
| 896.42872 | 0 |
| 896.66957 | 0 |
| 896.91043 | 0 |
| 897.15129 | 0 |
| 897.39217 | 0 |
| 897.63305 | 0 |
| 897.87393 | 0 |
| 898.11483 | 0 |
| 898.35573 | 0 |
| 898.59664 | 0 |
| 898.83756 | 0 |
| 899.07848 | 0 |
| 899.31942 | 0 |
| 899.56036 | 0 |
| 899.8013 | 0 |
| 900.04226 | 0 |
| 900.28322 | 0 |
| 900.52419 | 0 |
| 900.76516 | 0 |
| 901.00615 | 0 |
| 901.24714 | 0 |
| 901.48814 | 0 |
| 901.72914 | 0 |
| 901.97016 | 0 |
| 902.21118 | 0 |
| 902.45221 | 0 |
| 902.69324 | 0 |
| 902.93428 | 0 |
| 903.17533 | 0 |
| 903.41639 | 0 |
| 903.65746 | 0 |
| 903.89853 | 0 |
| 904.13961 | 0 |
| 904.3807 | 0 |
| 904.62179 | 0 |
| 904.86289 | 0 |
| 905.104 | 0 |
| 905.34512 | 0 |
| 905.58624 | 0 |
| 905.82737 | 0 |
| 906.06851 | 0 |
| 906.30966 | 0 |
| 906.55081 | 0 |
| 906.79197 | 0 |
| 907.03314 | 0 |
| 907.27431 | 0 |
| 907.51549 | 0 |
| 907.75668 | 0 |
| 907.99788 | 0 |
| 908.23908 | 0 |
| 908.4803 | 0 |
| 908.72151 | 0 |
| 908.96274 | 0 |
| 909.20397 | 0 |
| 909.44521 | 0 |
| 909.68646 | 0 |
| 909.92772 | 0 |
| 910.16898 | 0 |
| 910.41025 | 0 |
| 910.65153 | 0 |
| 910.89281 | 0 |
| 911.1341 | 0 |
| 911.3754 | 0 |
| 911.61671 | 0 |
| 911.85802 | 0 |
| 912.09934 | 0 |
| 912.34067 | 0 |
| 912.582 | 0 |
| 912.82334 | 0 |
| 913.06469 | 0 |
| 913.30605 | 0 |
| 913.54741 | 0 |
| 913.78878 | 0 |
| 914.03016 | 0 |
| 914.27155 | 0 |
| 914.51294 | 0 |
| 914.75434 | 0 |
| 914.99575 | 0 |
| 915.23716 | 0 |
| 915.47858 | 0 |
| 915.72001 | 0 |
| 915.96145 | 0 |
| 916.20289 | 0 |
| 916.44434 | 0 |
| 916.6858 | 0 |
| 916.92726 | 0 |
| 917.16873 | 0 |
| 917.41021 | 0 |
| 917.6517 | 0 |
| 917.89319 | 0 |
| 918.13469 | 0 |
| 918.3762 | 0 |
| 918.61771 | 0 |
| 918.85924 | 0 |
| 919.10077 | 0 |
| 919.3423 | 0 |
| 919.58385 | 0 |
| 919.8254 | 0 |
| 920.06695 | 0 |
| 920.30852 | 0 |
| 920.55009 | 0 |
| 920.79167 | 0 |
| 921.03326 | 0 |
| 921.27485 | 0 |
| 921.51645 | 0 |
| 921.75806 | 0 |
| 921.99967 | 0 |
| 922.24129 | 0 |
| 922.48292 | 0 |
| 922.72456 | 0 |
| 922.9662 | 0 |
| 923.20785 | 0 |
| 923.44951 | 0 |
| 923.69117 | 0 |
| 923.93284 | 0 |
| 924.17452 | 0 |
| 924.41621 | 0 |
| 924.6579 | 0 |
| 924.8996 | 0 |
| 925.14131 | 0 |
| 925.38302 | 0 |
| 925.62474 | 0 |
| 925.86647 | 0 |
| 926.10821 | 0 |
| 926.34995 | 0 |
| 926.5917 | 0 |
| 926.83345 | 0 |
| 927.07522 | 0 |
| 927.31699 | 0 |
| 927.55876 | 0 |
| 927.80055 | 0 |
| 928.04234 | 0 |
| 928.28414 | 0 |
| 928.52594 | 0 |
| 928.76776 | 0 |
| 929.00958 | 0 |
| 929.2514 | 0 |
| 929.49324 | 0 |
| 929.73508 | 0 |
| 929.97693 | 0 |
| 930.21878 | 0 |
| 930.46064 | 0 |
| 930.70251 | 0 |
| 930.94439 | 0 |
| 931.18627 | 0 |
| 931.42816 | 0 |
| 931.67006 | 0 |
| 931.91196 | 0 |
| 932.15387 | 0 |
| 932.39579 | 0 |
| 932.63771 | 0 |
| 932.87964 | 0 |
| 933.12158 | 0 |
| 933.36353 | 0 |
| 933.60548 | 0 |
| 933.84744 | 0 |
| 934.08941 | 0 |
| 934.33138 | 0 |
| 934.57336 | 0 |
| 934.81535 | 0 |
| 935.05734 | 0 |
| 935.29934 | 0 |
| 935.54135 | 0 |
| 935.78337 | 0 |
| 936.02539 | 0 |
| 936.26742 | 0 |
| 936.50945 | 0 |
| 936.7515 | 0 |
| 936.99355 | 0 |
| 937.2356 | 0 |
| 937.47767 | 0 |
| 937.71974 | 0 |
| 937.96181 | 0 |
| 938.2039 | 0 |
| 938.44599 | 0 |
| 938.68809 | 0 |
| 938.93019 | 0 |
| 939.1723 | 0 |
| 939.41442 | 0 |
| 939.65655 | 0 |
| 939.89868 | 0 |
| 940.14082 | 0 |
| 940.38297 | 0 |
| 940.62512 | 0 |
| 940.86728 | 0 |
| 941.10945 | 0 |
| 941.35162 | 0 |
| 941.5938 | 0 |
| 941.83599 | 0 |
| 942.07818 | 0 |
| 942.32038 | 0 |
| 942.56259 | 0 |
| 942.80481 | 0 |
| 943.04703 | 0 |
| 943.28926 | 0 |
| 943.53149 | 0 |
| 943.77373 | 0 |
| 944.01598 | 0 |
| 944.25824 | 0 |
| 944.5005 | 0 |
| 944.74277 | 0 |
| 944.98505 | 0 |
| 945.22733 | 0 |
| 945.46962 | 0 |
| 945.71192 | 0 |
| 945.95422 | 0 |
| 946.19653 | 0 |
| 946.43885 | 0 |
| 946.68117 | 0 |
| 946.9235 | 0 |
| 947.16584 | 0 |
| 947.40819 | 0 |
| 947.65054 | 0 |
| 947.8929 | 0 |
| 948.13526 | 0 |
| 948.37763 | 0 |
| 948.62001 | 0 |
| 948.8624 | 0 |
| 949.10479 | 0 |
| 949.34719 | 0 |
| 949.58959 | 0 |
| 949.832 | 0 |
| 950.07442 | 0 |
| 950.31685 | 0 |
| 950.55928 | 0 |
| 950.80172 | 0 |
| 951.04417 | 0 |
| 951.28662 | 0 |
| 951.52908 | 0 |
| 951.77154 | 0 |
| 952.01402 | 0 |
| 952.2565 | 0 |
| 952.49898 | 0 |
| 952.74148 | 0 |
| 952.98397 | 0 |
| 953.22648 | 0 |
| 953.46899 | 0 |
| 953.71151 | 0 |
| 953.95404 | 0 |
| 954.19657 | 0 |
| 954.43911 | 0 |
| 954.68166 | 0 |
| 954.92421 | 0 |
| 955.16677 | 0 |
| 955.40934 | 0 |
| 955.65191 | 0 |
| 955.89449 | 0 |
| 956.13708 | 0 |
| 956.37967 | 0 |
| 956.62227 | 0 |
| 956.86488 | 0 |
| 957.10749 | 0 |
| 957.35011 | 0 |
| 957.59274 | 0 |
| 957.83537 | 0 |
| 958.07801 | 0 |
| 958.32066 | 0 |
| 958.56331 | 0 |
| 958.80597 | 0 |
| 959.04864 | 0 |
| 959.29131 | 0 |
| 959.53399 | 0 |
| 959.77668 | 0 |
| 960.01937 | 0 |
| 960.26207 | 0 |
| 960.50478 | 0 |
| 960.74749 | 0 |
| 960.99021 | 0 |
| 961.23294 | 0 |
| 961.47567 | 0 |
| 961.71841 | 0 |
| 961.96116 | 0 |
| 962.20391 | 0 |
| 962.44667 | 0 |
| 962.68943 | 0 |
| 962.93221 | 0 |
| 963.17499 | 0 |
| 963.41777 | 0 |
| 963.66056 | 0 |
| 963.90336 | 0 |
| 964.14617 | 0 |
| 964.38898 | 0 |
| 964.6318 | 0 |
| 964.87462 | 0 |
| 965.11745 | 0 |
| 965.36029 | 0 |
| 965.60314 | 0 |
| 965.84599 | 0 |
| 966.08885 | 0 |
| 966.33171 | 0 |
| 966.57458 | 0 |
| 966.81746 | 0 |
| 967.06034 | 0 |
| 967.30323 | 0 |
| 967.54613 | 0 |
| 967.78903 | 0 |
| 968.03194 | 0 |
| 968.27486 | 0 |
| 968.51778 | 0 |
| 968.76071 | 0 |
| 969.00365 | 0 |
| 969.24659 | 0 |
| 969.48954 | 0 |
| 969.73249 | 0 |
| 969.97546 | 0 |
| 970.21843 | 0 |
| 970.4614 | 0 |
| 970.70438 | 0 |
| 970.94737 | 0 |
| 971.19036 | 0 |
| 971.43337 | 0 |
| 971.67637 | 0 |
| 971.91939 | 0 |
| 972.16241 | 0 |
| 972.40543 | 0 |
| 972.64847 | 0 |
| 972.89151 | 0 |
| 973.13455 | 0 |
| 973.37761 | 0 |
| 973.62067 | 0 |
| 973.86373 | 0 |
| 974.1068 | 0 |
| 974.34988 | 0 |
| 974.59297 | 0 |
| 974.83606 | 0 |
| 975.07916 | 0 |
| 975.32226 | 0 |
| 975.56537 | 0 |
| 975.80849 | 0 |
| 976.05161 | 0 |
| 976.29474 | 0 |
| 976.53788 | 0 |
| 976.78102 | 0 |
| 977.02417 | 0 |
| 977.26733 | 0 |
| 977.51049 | 0 |
| 977.75366 | 0 |
| 977.99683 | 0 |
| 978.24001 | 0 |
| 978.4832 | 0 |
| 978.72639 | 0 |
| 978.96959 | 0 |
| 979.2128 | 0 |
| 979.45601 | 0 |
| 979.69923 | 0 |
| 979.94246 | 0 |
| 980.18569 | 0 |
| 980.42893 | 0 |
| 980.67217 | 0 |
| 980.91543 | 0 |
| 981.15868 | 0 |
| 981.40195 | 0 |
| 981.64522 | 0 |
| 981.88849 | 0 |
| 982.13178 | 0 |
| 982.37507 | 0 |
| 982.61836 | 0 |
| 982.86166 | 0 |
| 983.10497 | 0 |
| 983.34829 | 0 |
| 983.59161 | 0 |
| 983.83494 | 0 |
| 984.07827 | 0 |
| 984.32161 | 0 |
| 984.56496 | 0 |
| 984.80831 | 0 |
| 985.05167 | 0 |
| 985.29503 | 0 |
| 985.5384 | 0 |
| 985.78178 | 0 |
| 986.02517 | 0 |
| 986.26856 | 0 |
| 986.51195 | 0 |
| 986.75536 | 0 |
| 986.99876 | 0 |
| 987.24218 | 0 |
| 987.4856 | 0 |
| 987.72903 | 0 |
| 987.97246 | 0 |
| 988.21591 | 0 |
| 988.45935 | 0 |
| 988.7028 | 0 |
| 988.94626 | 0 |
| 989.18973 | 0 |
| 989.4332 | 0 |
| 989.67668 | 0 |
| 989.92016 | 0 |
| 990.16365 | 0 |
| 990.40715 | 0 |
| 990.65065 | 0 |
| 990.89416 | 0 |
| 991.13768 | 0 |
| 991.3812 | 0 |
| 991.62473 | 0 |
| 991.86826 | 0 |
| 992.1118 | 0 |
| 992.35535 | 0 |
| 992.5989 | 0 |
| 992.84246 | 0 |
| 993.08603 | 0 |
| 993.3296 | 0 |
| 993.57318 | 0 |
| 993.81676 | 0 |
| 994.06035 | 0 |
| 994.30395 | 0 |
| 994.54755 | 0 |
| 994.79116 | 0 |
| 995.03477 | 0 |
| 995.27839 | 0 |
| 995.52202 | 0 |
| 995.76565 | 0 |
| 996.00929 | 0 |
| 996.25294 | 0 |
| 996.49659 | 0 |
| 996.74025 | 0 |
| 996.98391 | 0 |
| 997.22758 | 0 |
| 997.47126 | 0 |
| 997.71494 | 0 |
| 997.95863 | 0 |
| 998.20232 | 0 |
| 998.44602 | 0 |
| 998.68973 | 0 |
| 998.93344 | 0 |
| 999.17716 | 0 |
| 999.42089 | 0 |
| 999.66462 | 0 |
| 999.90836 | 0 |
| 1000.1521 | 0 |
| 1000.39585 | 0 |
| 1000.63961 | 0 |
| 1000.88337 | 0 |
| 1001.12714 | 0 |
| 1001.37091 | 0 |
| 1001.61469 | 0 |
| 1001.85848 | 0 |
| 1002.10227 | 0 |
| 1002.34607 | 0 |
| 1002.58987 | 0 |
| 1002.83368 | 0 |
| 1003.0775 | 0 |
| 1003.32132 | 0 |
| 1003.56515 | 0 |
| 1003.80899 | 0 |
| 1004.05283 | 0 |
| 1004.29668 | 0 |
| 1004.54053 | 0 |
| 1004.78439 | 0 |
| 1005.02825 | 0 |
| 1005.27212 | 0 |
| 1005.516 | 0 |
| 1005.75989 | 0 |
| 1006.00378 | 0 |
| 1006.24767 | 0 |
| 1006.49157 | 0 |
| 1006.73548 | 0 |
| 1006.97939 | 0 |
| 1007.22331 | 0 |
| 1007.46724 | 0 |
| 1007.71117 | 0 |
| 1007.95511 | 0 |
| 1008.19905 | 0 |
| 1008.443 | 0 |
| 1008.68696 | 0 |
| 1008.93092 | 0 |
| 1009.17489 | 0 |
| 1009.41886 | 0 |
| 1009.66284 | 0 |
| 1009.90682 | 0 |
| 1010.15082 | 0 |
| 1010.39481 | 0 |
| 1010.63882 | 0 |
| 1010.88283 | 0 |
| 1011.12684 | 0 |
| 1011.37086 | 0 |
| 1011.61489 | 0 |
| 1011.85892 | 0 |
| 1012.10296 | 0 |
| 1012.34701 | 0 |
| 1012.59106 | 0 |
| 1012.83512 | 0 |
| 1013.07918 | 0 |
| 1013.32325 | 0 |
| 1013.56732 | 0 |
| 1013.81141 | 0 |
| 1014.05549 | 0 |
| 1014.29959 | 0 |
| 1014.54368 | 0 |
| 1014.78779 | 0 |
| 1015.0319 | 0 |
| 1015.27602 | 0 |
| 1015.52014 | 0 |
| 1015.76427 | 0 |
| 1016.0084 | 0 |
| 1016.25254 | 0 |
| 1016.49669 | 0 |
| 1016.74084 | 0 |
| 1016.985 | 0 |
| 1017.22916 | 0 |
| 1017.47333 | 0 |
| 1017.71751 | 0 |
| 1017.96169 | 0 |
| 1018.20587 | 0 |
| 1018.45007 | 0 |
| 1018.69427 | 0 |
| 1018.93847 | 0 |
| 1019.18268 | 0 |
| 1019.4269 | 0 |
| 1019.67112 | 0 |
| 1019.91535 | 0 |
| 1020.15958 | 0 |
| 1020.40382 | 0 |
| 1020.64807 | 0 |
| 1020.89232 | 0 |
| 1021.13658 | 0 |
| 1021.38084 | 0 |
| 1021.62511 | 0 |
| 1021.86939 | 0 |
| 1022.11367 | 0 |
| 1022.35795 | 0 |
| 1022.60225 | 0 |
| 1022.84655 | 0 |
| 1023.09085 | 0 |
| 1023.33516 | 0 |
| 1023.57948 | 0 |
| 1023.8238 | 0 |
| 1024.06813 | 0 |
| 1024.31246 | 0 |
| 1024.5568 | 0 |
| 1024.80114 | 0 |
| 1025.04549 | 0 |
| 1025.28985 | 0 |
| 1025.53421 | 0 |
| 1025.77858 | 0 |
| 1026.02295 | 0 |
| 1026.26733 | 0 |
| 1026.51172 | 0 |
| 1026.75611 | 0 |
| 1027.00051 | 0 |
| 1027.24491 | 0 |
| 1027.48932 | 0 |
| 1027.73373 | 0 |
| 1027.97815 | 0 |